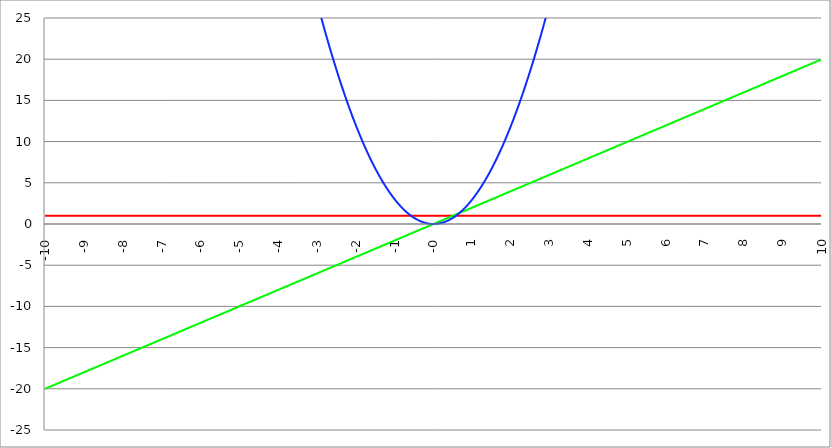
| Category | Series 1 | Series 0 | Series 2 |
|---|---|---|---|
| -10.0 | 1 | -20 | 300 |
| -9.99 | 1 | -19.98 | 299.4 |
| -9.98 | 1 | -19.96 | 298.801 |
| -9.97 | 1 | -19.94 | 298.203 |
| -9.96 | 1 | -19.92 | 297.605 |
| -9.95 | 1 | -19.9 | 297.008 |
| -9.940000000000001 | 1 | -19.88 | 296.411 |
| -9.930000000000001 | 1 | -19.86 | 295.815 |
| -9.920000000000002 | 1 | -19.84 | 295.219 |
| -9.91 | 1 | -19.82 | 294.624 |
| -9.900000000000002 | 1 | -19.8 | 294.03 |
| -9.890000000000002 | 1 | -19.78 | 293.436 |
| -9.880000000000003 | 1 | -19.76 | 292.843 |
| -9.870000000000003 | 1 | -19.74 | 292.251 |
| -9.860000000000001 | 1 | -19.72 | 291.659 |
| -9.850000000000003 | 1 | -19.7 | 291.068 |
| -9.840000000000003 | 1 | -19.68 | 290.477 |
| -9.830000000000004 | 1 | -19.66 | 289.887 |
| -9.820000000000004 | 1 | -19.64 | 289.297 |
| -9.810000000000004 | 1 | -19.62 | 288.708 |
| -9.800000000000004 | 1 | -19.6 | 288.12 |
| -9.790000000000004 | 1 | -19.58 | 287.532 |
| -9.780000000000005 | 1 | -19.56 | 286.945 |
| -9.770000000000005 | 1 | -19.54 | 286.359 |
| -9.760000000000005 | 1 | -19.52 | 285.773 |
| -9.750000000000005 | 1 | -19.5 | 285.188 |
| -9.740000000000006 | 1 | -19.48 | 284.603 |
| -9.730000000000006 | 1 | -19.46 | 284.019 |
| -9.720000000000006 | 1 | -19.44 | 283.435 |
| -9.710000000000006 | 1 | -19.42 | 282.852 |
| -9.700000000000006 | 1 | -19.4 | 282.27 |
| -9.690000000000007 | 1 | -19.38 | 281.688 |
| -9.680000000000007 | 1 | -19.36 | 281.107 |
| -9.670000000000007 | 1 | -19.34 | 280.527 |
| -9.660000000000007 | 1 | -19.32 | 279.947 |
| -9.650000000000007 | 1 | -19.3 | 279.368 |
| -9.640000000000008 | 1 | -19.28 | 278.789 |
| -9.630000000000008 | 1 | -19.26 | 278.211 |
| -9.620000000000008 | 1 | -19.24 | 277.633 |
| -9.610000000000008 | 1 | -19.22 | 277.056 |
| -9.600000000000009 | 1 | -19.2 | 276.48 |
| -9.590000000000009 | 1 | -19.18 | 275.904 |
| -9.580000000000007 | 1 | -19.16 | 275.329 |
| -9.57000000000001 | 1 | -19.14 | 274.755 |
| -9.56000000000001 | 1 | -19.12 | 274.181 |
| -9.55000000000001 | 1 | -19.1 | 273.608 |
| -9.54000000000001 | 1 | -19.08 | 273.035 |
| -9.53000000000001 | 1 | -19.06 | 272.463 |
| -9.52000000000001 | 1 | -19.04 | 271.891 |
| -9.51000000000001 | 1 | -19.02 | 271.32 |
| -9.50000000000001 | 1 | -19 | 270.75 |
| -9.49000000000001 | 1 | -18.98 | 270.18 |
| -9.48000000000001 | 1 | -18.96 | 269.611 |
| -9.47000000000001 | 1 | -18.94 | 269.043 |
| -9.46000000000001 | 1 | -18.92 | 268.475 |
| -9.45000000000001 | 1 | -18.9 | 267.908 |
| -9.44000000000001 | 1 | -18.88 | 267.341 |
| -9.430000000000012 | 1 | -18.86 | 266.775 |
| -9.420000000000012 | 1 | -18.84 | 266.209 |
| -9.410000000000013 | 1 | -18.82 | 265.644 |
| -9.400000000000013 | 1 | -18.8 | 265.08 |
| -9.390000000000011 | 1 | -18.78 | 264.516 |
| -9.380000000000013 | 1 | -18.76 | 263.953 |
| -9.370000000000013 | 1 | -18.74 | 263.391 |
| -9.360000000000014 | 1 | -18.72 | 262.829 |
| -9.350000000000014 | 1 | -18.7 | 262.268 |
| -9.340000000000014 | 1 | -18.68 | 261.707 |
| -9.330000000000014 | 1 | -18.66 | 261.147 |
| -9.320000000000014 | 1 | -18.64 | 260.587 |
| -9.310000000000015 | 1 | -18.62 | 260.028 |
| -9.300000000000013 | 1 | -18.6 | 259.47 |
| -9.290000000000015 | 1 | -18.58 | 258.912 |
| -9.280000000000015 | 1 | -18.56 | 258.355 |
| -9.270000000000016 | 1 | -18.54 | 257.799 |
| -9.260000000000016 | 1 | -18.52 | 257.243 |
| -9.250000000000014 | 1 | -18.5 | 256.688 |
| -9.240000000000016 | 1 | -18.48 | 256.133 |
| -9.230000000000016 | 1 | -18.46 | 255.579 |
| -9.220000000000017 | 1 | -18.44 | 255.025 |
| -9.210000000000017 | 1 | -18.42 | 254.472 |
| -9.200000000000017 | 1 | -18.4 | 253.92 |
| -9.190000000000017 | 1 | -18.38 | 253.368 |
| -9.180000000000017 | 1 | -18.36 | 252.817 |
| -9.170000000000018 | 1 | -18.34 | 252.267 |
| -9.160000000000016 | 1 | -18.32 | 251.717 |
| -9.150000000000018 | 1 | -18.3 | 251.168 |
| -9.140000000000018 | 1 | -18.28 | 250.619 |
| -9.130000000000019 | 1 | -18.26 | 250.071 |
| -9.120000000000019 | 1 | -18.24 | 249.523 |
| -9.110000000000017 | 1 | -18.22 | 248.976 |
| -9.10000000000002 | 1 | -18.2 | 248.43 |
| -9.09000000000002 | 1 | -18.18 | 247.884 |
| -9.08000000000002 | 1 | -18.16 | 247.339 |
| -9.07000000000002 | 1 | -18.14 | 246.795 |
| -9.06000000000002 | 1 | -18.12 | 246.251 |
| -9.05000000000002 | 1 | -18.1 | 245.708 |
| -9.04000000000002 | 1 | -18.08 | 245.165 |
| -9.03000000000002 | 1 | -18.06 | 244.623 |
| -9.020000000000021 | 1 | -18.04 | 244.081 |
| -9.010000000000021 | 1 | -18.02 | 243.54 |
| -9.000000000000021 | 1 | -18 | 243 |
| -8.990000000000022 | 1 | -17.98 | 242.46 |
| -8.980000000000022 | 1 | -17.96 | 241.921 |
| -8.97000000000002 | 1 | -17.94 | 241.383 |
| -8.960000000000022 | 1 | -17.92 | 240.845 |
| -8.950000000000022 | 1 | -17.9 | 240.308 |
| -8.940000000000023 | 1 | -17.88 | 239.771 |
| -8.930000000000023 | 1 | -17.86 | 239.235 |
| -8.920000000000023 | 1 | -17.84 | 238.699 |
| -8.910000000000023 | 1 | -17.82 | 238.164 |
| -8.900000000000023 | 1 | -17.8 | 237.63 |
| -8.890000000000024 | 1 | -17.78 | 237.096 |
| -8.880000000000024 | 1 | -17.76 | 236.563 |
| -8.870000000000024 | 1 | -17.74 | 236.031 |
| -8.860000000000024 | 1 | -17.72 | 235.499 |
| -8.850000000000025 | 1 | -17.7 | 234.968 |
| -8.840000000000025 | 1 | -17.68 | 234.437 |
| -8.830000000000025 | 1 | -17.66 | 233.907 |
| -8.820000000000025 | 1 | -17.64 | 233.377 |
| -8.810000000000025 | 1 | -17.62 | 232.848 |
| -8.800000000000026 | 1 | -17.6 | 232.32 |
| -8.790000000000026 | 1 | -17.58 | 231.792 |
| -8.780000000000026 | 1 | -17.56 | 231.265 |
| -8.770000000000026 | 1 | -17.54 | 230.739 |
| -8.760000000000026 | 1 | -17.52 | 230.213 |
| -8.750000000000027 | 1 | -17.5 | 229.688 |
| -8.740000000000027 | 1 | -17.48 | 229.163 |
| -8.730000000000027 | 1 | -17.46 | 228.639 |
| -8.720000000000027 | 1 | -17.44 | 228.115 |
| -8.710000000000027 | 1 | -17.42 | 227.592 |
| -8.700000000000028 | 1 | -17.4 | 227.07 |
| -8.690000000000028 | 1 | -17.38 | 226.548 |
| -8.680000000000028 | 1 | -17.36 | 226.027 |
| -8.670000000000028 | 1 | -17.34 | 225.507 |
| -8.660000000000029 | 1 | -17.32 | 224.987 |
| -8.650000000000029 | 1 | -17.3 | 224.468 |
| -8.640000000000029 | 1 | -17.28 | 223.949 |
| -8.63000000000003 | 1 | -17.26 | 223.431 |
| -8.62000000000003 | 1 | -17.24 | 222.913 |
| -8.61000000000003 | 1 | -17.22 | 222.396 |
| -8.60000000000003 | 1 | -17.2 | 221.88 |
| -8.59000000000003 | 1 | -17.18 | 221.364 |
| -8.58000000000003 | 1 | -17.16 | 220.849 |
| -8.57000000000003 | 1 | -17.14 | 220.335 |
| -8.56000000000003 | 1 | -17.12 | 219.821 |
| -8.55000000000003 | 1 | -17.1 | 219.308 |
| -8.540000000000031 | 1 | -17.08 | 218.795 |
| -8.530000000000031 | 1 | -17.06 | 218.283 |
| -8.520000000000032 | 1 | -17.04 | 217.771 |
| -8.510000000000032 | 1 | -17.02 | 217.26 |
| -8.50000000000003 | 1 | -17 | 216.75 |
| -8.490000000000032 | 1 | -16.98 | 216.24 |
| -8.480000000000032 | 1 | -16.96 | 215.731 |
| -8.470000000000033 | 1 | -16.94 | 215.223 |
| -8.460000000000033 | 1 | -16.92 | 214.715 |
| -8.450000000000033 | 1 | -16.9 | 214.208 |
| -8.440000000000033 | 1 | -16.88 | 213.701 |
| -8.430000000000033 | 1 | -16.86 | 213.195 |
| -8.420000000000034 | 1 | -16.84 | 212.689 |
| -8.410000000000032 | 1 | -16.82 | 212.184 |
| -8.400000000000034 | 1 | -16.8 | 211.68 |
| -8.390000000000034 | 1 | -16.78 | 211.176 |
| -8.380000000000035 | 1 | -16.76 | 210.673 |
| -8.370000000000035 | 1 | -16.74 | 210.171 |
| -8.360000000000033 | 1 | -16.72 | 209.669 |
| -8.350000000000035 | 1 | -16.7 | 209.168 |
| -8.340000000000035 | 1 | -16.68 | 208.667 |
| -8.330000000000036 | 1 | -16.66 | 208.167 |
| -8.320000000000036 | 1 | -16.64 | 207.667 |
| -8.310000000000034 | 1 | -16.62 | 207.168 |
| -8.300000000000036 | 1 | -16.6 | 206.67 |
| -8.290000000000036 | 1 | -16.58 | 206.172 |
| -8.280000000000037 | 1 | -16.56 | 205.675 |
| -8.270000000000037 | 1 | -16.54 | 205.179 |
| -8.260000000000037 | 1 | -16.52 | 204.683 |
| -8.250000000000037 | 1 | -16.5 | 204.188 |
| -8.240000000000038 | 1 | -16.48 | 203.693 |
| -8.230000000000038 | 1 | -16.46 | 203.199 |
| -8.220000000000038 | 1 | -16.44 | 202.705 |
| -8.210000000000038 | 1 | -16.42 | 202.212 |
| -8.200000000000038 | 1 | -16.4 | 201.72 |
| -8.190000000000039 | 1 | -16.38 | 201.228 |
| -8.180000000000039 | 1 | -16.36 | 200.737 |
| -8.170000000000037 | 1 | -16.34 | 200.247 |
| -8.16000000000004 | 1 | -16.32 | 199.757 |
| -8.15000000000004 | 1 | -16.3 | 199.268 |
| -8.14000000000004 | 1 | -16.28 | 198.779 |
| -8.13000000000004 | 1 | -16.26 | 198.291 |
| -8.12000000000004 | 1 | -16.24 | 197.803 |
| -8.11000000000004 | 1 | -16.22 | 197.316 |
| -8.10000000000004 | 1 | -16.2 | 196.83 |
| -8.09000000000004 | 1 | -16.18 | 196.344 |
| -8.08000000000004 | 1 | -16.16 | 195.859 |
| -8.07000000000004 | 1 | -16.14 | 195.375 |
| -8.06000000000004 | 1 | -16.12 | 194.891 |
| -8.05000000000004 | 1 | -16.1 | 194.408 |
| -8.040000000000042 | 1 | -16.08 | 193.925 |
| -8.03000000000004 | 1 | -16.06 | 193.443 |
| -8.020000000000042 | 1 | -16.04 | 192.961 |
| -8.010000000000042 | 1 | -16.02 | 192.48 |
| -8.000000000000043 | 1 | -16 | 192 |
| -7.990000000000043 | 1 | -15.98 | 191.52 |
| -7.980000000000043 | 1 | -15.96 | 191.041 |
| -7.970000000000043 | 1 | -15.94 | 190.563 |
| -7.960000000000043 | 1 | -15.92 | 190.085 |
| -7.950000000000044 | 1 | -15.9 | 189.608 |
| -7.940000000000044 | 1 | -15.88 | 189.131 |
| -7.930000000000044 | 1 | -15.86 | 188.655 |
| -7.920000000000044 | 1 | -15.84 | 188.179 |
| -7.910000000000044 | 1 | -15.82 | 187.704 |
| -7.900000000000044 | 1 | -15.8 | 187.23 |
| -7.890000000000045 | 1 | -15.78 | 186.756 |
| -7.880000000000045 | 1 | -15.76 | 186.283 |
| -7.870000000000045 | 1 | -15.74 | 185.811 |
| -7.860000000000046 | 1 | -15.72 | 185.339 |
| -7.850000000000046 | 1 | -15.7 | 184.868 |
| -7.840000000000046 | 1 | -15.68 | 184.397 |
| -7.830000000000046 | 1 | -15.66 | 183.927 |
| -7.820000000000046 | 1 | -15.64 | 183.457 |
| -7.810000000000047 | 1 | -15.62 | 182.988 |
| -7.800000000000047 | 1 | -15.6 | 182.52 |
| -7.790000000000047 | 1 | -15.58 | 182.052 |
| -7.780000000000047 | 1 | -15.56 | 181.585 |
| -7.770000000000047 | 1 | -15.54 | 181.119 |
| -7.760000000000048 | 1 | -15.52 | 180.653 |
| -7.750000000000048 | 1 | -15.5 | 180.188 |
| -7.740000000000048 | 1 | -15.48 | 179.723 |
| -7.730000000000048 | 1 | -15.46 | 179.259 |
| -7.720000000000049 | 1 | -15.44 | 178.795 |
| -7.710000000000049 | 1 | -15.42 | 178.332 |
| -7.700000000000049 | 1 | -15.4 | 177.87 |
| -7.690000000000049 | 1 | -15.38 | 177.408 |
| -7.680000000000049 | 1 | -15.36 | 176.947 |
| -7.67000000000005 | 1 | -15.34 | 176.487 |
| -7.66000000000005 | 1 | -15.32 | 176.027 |
| -7.65000000000005 | 1 | -15.3 | 175.568 |
| -7.64000000000005 | 1 | -15.28 | 175.109 |
| -7.63000000000005 | 1 | -15.26 | 174.651 |
| -7.620000000000051 | 1 | -15.24 | 174.193 |
| -7.610000000000051 | 1 | -15.22 | 173.736 |
| -7.600000000000051 | 1 | -15.2 | 173.28 |
| -7.590000000000051 | 1 | -15.18 | 172.824 |
| -7.580000000000052 | 1 | -15.16 | 172.369 |
| -7.570000000000052 | 1 | -15.14 | 171.915 |
| -7.560000000000052 | 1 | -15.12 | 171.461 |
| -7.550000000000052 | 1 | -15.1 | 171.008 |
| -7.540000000000052 | 1 | -15.08 | 170.555 |
| -7.530000000000053 | 1 | -15.06 | 170.103 |
| -7.520000000000053 | 1 | -15.04 | 169.651 |
| -7.510000000000053 | 1 | -15.02 | 169.2 |
| -7.500000000000053 | 1 | -15 | 168.75 |
| -7.490000000000053 | 1 | -14.98 | 168.3 |
| -7.480000000000054 | 1 | -14.96 | 167.851 |
| -7.470000000000054 | 1 | -14.94 | 167.403 |
| -7.460000000000054 | 1 | -14.92 | 166.955 |
| -7.450000000000054 | 1 | -14.9 | 166.508 |
| -7.440000000000054 | 1 | -14.88 | 166.061 |
| -7.430000000000054 | 1 | -14.86 | 165.615 |
| -7.420000000000055 | 1 | -14.84 | 165.169 |
| -7.410000000000055 | 1 | -14.82 | 164.724 |
| -7.400000000000055 | 1 | -14.8 | 164.28 |
| -7.390000000000056 | 1 | -14.78 | 163.836 |
| -7.380000000000056 | 1 | -14.76 | 163.393 |
| -7.370000000000056 | 1 | -14.74 | 162.951 |
| -7.360000000000056 | 1 | -14.72 | 162.509 |
| -7.350000000000056 | 1 | -14.7 | 162.068 |
| -7.340000000000057 | 1 | -14.68 | 161.627 |
| -7.330000000000057 | 1 | -14.66 | 161.187 |
| -7.320000000000057 | 1 | -14.64 | 160.747 |
| -7.310000000000057 | 1 | -14.62 | 160.308 |
| -7.300000000000058 | 1 | -14.6 | 159.87 |
| -7.290000000000058 | 1 | -14.58 | 159.432 |
| -7.280000000000058 | 1 | -14.56 | 158.995 |
| -7.270000000000058 | 1 | -14.54 | 158.559 |
| -7.260000000000058 | 1 | -14.52 | 158.123 |
| -7.250000000000059 | 1 | -14.5 | 157.688 |
| -7.240000000000059 | 1 | -14.48 | 157.253 |
| -7.23000000000006 | 1 | -14.46 | 156.819 |
| -7.220000000000059 | 1 | -14.44 | 156.385 |
| -7.210000000000059 | 1 | -14.42 | 155.952 |
| -7.20000000000006 | 1 | -14.4 | 155.52 |
| -7.19000000000006 | 1 | -14.38 | 155.088 |
| -7.18000000000006 | 1 | -14.36 | 154.657 |
| -7.17000000000006 | 1 | -14.34 | 154.227 |
| -7.160000000000061 | 1 | -14.32 | 153.797 |
| -7.150000000000061 | 1 | -14.3 | 153.368 |
| -7.140000000000061 | 1 | -14.28 | 152.939 |
| -7.130000000000061 | 1 | -14.26 | 152.511 |
| -7.120000000000061 | 1 | -14.24 | 152.083 |
| -7.110000000000062 | 1 | -14.22 | 151.656 |
| -7.100000000000062 | 1 | -14.2 | 151.23 |
| -7.090000000000062 | 1 | -14.18 | 150.804 |
| -7.080000000000062 | 1 | -14.16 | 150.379 |
| -7.070000000000062 | 1 | -14.14 | 149.955 |
| -7.060000000000063 | 1 | -14.12 | 149.531 |
| -7.050000000000063 | 1 | -14.1 | 149.108 |
| -7.040000000000063 | 1 | -14.08 | 148.685 |
| -7.030000000000063 | 1 | -14.06 | 148.263 |
| -7.020000000000064 | 1 | -14.04 | 147.841 |
| -7.010000000000064 | 1 | -14.02 | 147.42 |
| -7.000000000000064 | 1 | -14 | 147 |
| -6.990000000000064 | 1 | -13.98 | 146.58 |
| -6.980000000000064 | 1 | -13.96 | 146.161 |
| -6.970000000000064 | 1 | -13.94 | 145.743 |
| -6.960000000000064 | 1 | -13.92 | 145.325 |
| -6.950000000000064 | 1 | -13.9 | 144.908 |
| -6.940000000000065 | 1 | -13.88 | 144.491 |
| -6.930000000000065 | 1 | -13.86 | 144.075 |
| -6.920000000000065 | 1 | -13.84 | 143.659 |
| -6.910000000000065 | 1 | -13.82 | 143.244 |
| -6.900000000000066 | 1 | -13.8 | 142.83 |
| -6.890000000000066 | 1 | -13.78 | 142.416 |
| -6.880000000000066 | 1 | -13.76 | 142.003 |
| -6.870000000000066 | 1 | -13.74 | 141.591 |
| -6.860000000000067 | 1 | -13.72 | 141.179 |
| -6.850000000000067 | 1 | -13.7 | 140.768 |
| -6.840000000000067 | 1 | -13.68 | 140.357 |
| -6.830000000000067 | 1 | -13.66 | 139.947 |
| -6.820000000000068 | 1 | -13.64 | 139.537 |
| -6.810000000000068 | 1 | -13.62 | 139.128 |
| -6.800000000000068 | 1 | -13.6 | 138.72 |
| -6.790000000000068 | 1 | -13.58 | 138.312 |
| -6.780000000000068 | 1 | -13.56 | 137.905 |
| -6.770000000000068 | 1 | -13.54 | 137.499 |
| -6.760000000000069 | 1 | -13.52 | 137.093 |
| -6.75000000000007 | 1 | -13.5 | 136.688 |
| -6.74000000000007 | 1 | -13.48 | 136.283 |
| -6.73000000000007 | 1 | -13.46 | 135.879 |
| -6.72000000000007 | 1 | -13.44 | 135.475 |
| -6.71000000000007 | 1 | -13.42 | 135.072 |
| -6.70000000000007 | 1 | -13.4 | 134.67 |
| -6.69000000000007 | 1 | -13.38 | 134.268 |
| -6.680000000000071 | 1 | -13.36 | 133.867 |
| -6.670000000000071 | 1 | -13.34 | 133.467 |
| -6.660000000000071 | 1 | -13.32 | 133.067 |
| -6.650000000000071 | 1 | -13.3 | 132.668 |
| -6.640000000000072 | 1 | -13.28 | 132.269 |
| -6.630000000000072 | 1 | -13.26 | 131.871 |
| -6.620000000000072 | 1 | -13.24 | 131.473 |
| -6.610000000000072 | 1 | -13.22 | 131.076 |
| -6.600000000000072 | 1 | -13.2 | 130.68 |
| -6.590000000000073 | 1 | -13.18 | 130.284 |
| -6.580000000000073 | 1 | -13.16 | 129.889 |
| -6.570000000000073 | 1 | -13.14 | 129.495 |
| -6.560000000000073 | 1 | -13.12 | 129.101 |
| -6.550000000000074 | 1 | -13.1 | 128.708 |
| -6.540000000000074 | 1 | -13.08 | 128.315 |
| -6.530000000000074 | 1 | -13.06 | 127.923 |
| -6.520000000000074 | 1 | -13.04 | 127.531 |
| -6.510000000000074 | 1 | -13.02 | 127.14 |
| -6.500000000000074 | 1 | -13 | 126.75 |
| -6.490000000000074 | 1 | -12.98 | 126.36 |
| -6.480000000000074 | 1 | -12.96 | 125.971 |
| -6.470000000000075 | 1 | -12.94 | 125.583 |
| -6.460000000000075 | 1 | -12.92 | 125.195 |
| -6.450000000000075 | 1 | -12.9 | 124.808 |
| -6.440000000000075 | 1 | -12.88 | 124.421 |
| -6.430000000000076 | 1 | -12.86 | 124.035 |
| -6.420000000000076 | 1 | -12.84 | 123.649 |
| -6.410000000000076 | 1 | -12.82 | 123.264 |
| -6.400000000000076 | 1 | -12.8 | 122.88 |
| -6.390000000000077 | 1 | -12.78 | 122.496 |
| -6.380000000000077 | 1 | -12.76 | 122.113 |
| -6.370000000000077 | 1 | -12.74 | 121.731 |
| -6.360000000000078 | 1 | -12.72 | 121.349 |
| -6.350000000000078 | 1 | -12.7 | 120.968 |
| -6.340000000000078 | 1 | -12.68 | 120.587 |
| -6.330000000000078 | 1 | -12.66 | 120.207 |
| -6.320000000000078 | 1 | -12.64 | 119.827 |
| -6.310000000000079 | 1 | -12.62 | 119.448 |
| -6.300000000000079 | 1 | -12.6 | 119.07 |
| -6.29000000000008 | 1 | -12.58 | 118.692 |
| -6.28000000000008 | 1 | -12.56 | 118.315 |
| -6.27000000000008 | 1 | -12.54 | 117.939 |
| -6.26000000000008 | 1 | -12.52 | 117.563 |
| -6.25000000000008 | 1 | -12.5 | 117.188 |
| -6.24000000000008 | 1 | -12.48 | 116.813 |
| -6.23000000000008 | 1 | -12.46 | 116.439 |
| -6.220000000000081 | 1 | -12.44 | 116.065 |
| -6.210000000000081 | 1 | -12.42 | 115.692 |
| -6.200000000000081 | 1 | -12.4 | 115.32 |
| -6.190000000000081 | 1 | -12.38 | 114.948 |
| -6.180000000000081 | 1 | -12.36 | 114.577 |
| -6.170000000000082 | 1 | -12.34 | 114.207 |
| -6.160000000000082 | 1 | -12.32 | 113.837 |
| -6.150000000000082 | 1 | -12.3 | 113.468 |
| -6.140000000000082 | 1 | -12.28 | 113.099 |
| -6.130000000000082 | 1 | -12.26 | 112.731 |
| -6.120000000000083 | 1 | -12.24 | 112.363 |
| -6.110000000000083 | 1 | -12.22 | 111.996 |
| -6.100000000000083 | 1 | -12.2 | 111.63 |
| -6.090000000000083 | 1 | -12.18 | 111.264 |
| -6.080000000000084 | 1 | -12.16 | 110.899 |
| -6.070000000000084 | 1 | -12.14 | 110.535 |
| -6.060000000000084 | 1 | -12.12 | 110.171 |
| -6.050000000000084 | 1 | -12.1 | 109.808 |
| -6.040000000000084 | 1 | -12.08 | 109.445 |
| -6.030000000000084 | 1 | -12.06 | 109.083 |
| -6.020000000000085 | 1 | -12.04 | 108.721 |
| -6.010000000000085 | 1 | -12.02 | 108.36 |
| -6.000000000000085 | 1 | -12 | 108 |
| -5.990000000000085 | 1 | -11.98 | 107.64 |
| -5.980000000000085 | 1 | -11.96 | 107.281 |
| -5.970000000000085 | 1 | -11.94 | 106.923 |
| -5.960000000000086 | 1 | -11.92 | 106.565 |
| -5.950000000000086 | 1 | -11.9 | 106.208 |
| -5.940000000000086 | 1 | -11.88 | 105.851 |
| -5.930000000000086 | 1 | -11.86 | 105.495 |
| -5.920000000000087 | 1 | -11.84 | 105.139 |
| -5.910000000000087 | 1 | -11.82 | 104.784 |
| -5.900000000000087 | 1 | -11.8 | 104.43 |
| -5.890000000000088 | 1 | -11.78 | 104.076 |
| -5.880000000000088 | 1 | -11.76 | 103.723 |
| -5.870000000000088 | 1 | -11.74 | 103.371 |
| -5.860000000000088 | 1 | -11.72 | 103.019 |
| -5.850000000000088 | 1 | -11.7 | 102.668 |
| -5.840000000000089 | 1 | -11.68 | 102.317 |
| -5.830000000000089 | 1 | -11.66 | 101.967 |
| -5.820000000000089 | 1 | -11.64 | 101.617 |
| -5.810000000000089 | 1 | -11.62 | 101.268 |
| -5.800000000000089 | 1 | -11.6 | 100.92 |
| -5.79000000000009 | 1 | -11.58 | 100.572 |
| -5.78000000000009 | 1 | -11.56 | 100.225 |
| -5.77000000000009 | 1 | -11.54 | 99.879 |
| -5.76000000000009 | 1 | -11.52 | 99.533 |
| -5.750000000000091 | 1 | -11.5 | 99.188 |
| -5.740000000000091 | 1 | -11.48 | 98.843 |
| -5.730000000000091 | 1 | -11.46 | 98.499 |
| -5.720000000000091 | 1 | -11.44 | 98.155 |
| -5.710000000000091 | 1 | -11.42 | 97.812 |
| -5.700000000000092 | 1 | -11.4 | 97.47 |
| -5.690000000000092 | 1 | -11.38 | 97.128 |
| -5.680000000000092 | 1 | -11.36 | 96.787 |
| -5.670000000000092 | 1 | -11.34 | 96.447 |
| -5.660000000000092 | 1 | -11.32 | 96.107 |
| -5.650000000000093 | 1 | -11.3 | 95.768 |
| -5.640000000000093 | 1 | -11.28 | 95.429 |
| -5.630000000000093 | 1 | -11.26 | 95.091 |
| -5.620000000000093 | 1 | -11.24 | 94.753 |
| -5.610000000000093 | 1 | -11.22 | 94.416 |
| -5.600000000000094 | 1 | -11.2 | 94.08 |
| -5.590000000000094 | 1 | -11.18 | 93.744 |
| -5.580000000000094 | 1 | -11.16 | 93.409 |
| -5.570000000000094 | 1 | -11.14 | 93.075 |
| -5.560000000000095 | 1 | -11.12 | 92.741 |
| -5.550000000000095 | 1 | -11.1 | 92.408 |
| -5.540000000000095 | 1 | -11.08 | 92.075 |
| -5.530000000000095 | 1 | -11.06 | 91.743 |
| -5.520000000000095 | 1 | -11.04 | 91.411 |
| -5.510000000000096 | 1 | -11.02 | 91.08 |
| -5.500000000000096 | 1 | -11 | 90.75 |
| -5.490000000000096 | 1 | -10.98 | 90.42 |
| -5.480000000000096 | 1 | -10.96 | 90.091 |
| -5.470000000000096 | 1 | -10.94 | 89.763 |
| -5.460000000000097 | 1 | -10.92 | 89.435 |
| -5.450000000000097 | 1 | -10.9 | 89.108 |
| -5.440000000000097 | 1 | -10.88 | 88.781 |
| -5.430000000000097 | 1 | -10.86 | 88.455 |
| -5.420000000000098 | 1 | -10.84 | 88.129 |
| -5.410000000000098 | 1 | -10.82 | 87.804 |
| -5.400000000000098 | 1 | -10.8 | 87.48 |
| -5.390000000000098 | 1 | -10.78 | 87.156 |
| -5.380000000000098 | 1 | -10.76 | 86.833 |
| -5.370000000000099 | 1 | -10.74 | 86.511 |
| -5.360000000000099 | 1 | -10.72 | 86.189 |
| -5.350000000000099 | 1 | -10.7 | 85.868 |
| -5.340000000000099 | 1 | -10.68 | 85.547 |
| -5.330000000000099 | 1 | -10.66 | 85.227 |
| -5.3200000000001 | 1 | -10.64 | 84.907 |
| -5.3100000000001 | 1 | -10.62 | 84.588 |
| -5.3000000000001 | 1 | -10.6 | 84.27 |
| -5.2900000000001 | 1 | -10.58 | 83.952 |
| -5.2800000000001 | 1 | -10.56 | 83.635 |
| -5.2700000000001 | 1 | -10.54 | 83.319 |
| -5.260000000000101 | 1 | -10.52 | 83.003 |
| -5.250000000000101 | 1 | -10.5 | 82.688 |
| -5.240000000000101 | 1 | -10.48 | 82.373 |
| -5.230000000000101 | 1 | -10.46 | 82.059 |
| -5.220000000000102 | 1 | -10.44 | 81.745 |
| -5.210000000000102 | 1 | -10.42 | 81.432 |
| -5.200000000000102 | 1 | -10.4 | 81.12 |
| -5.190000000000103 | 1 | -10.38 | 80.808 |
| -5.180000000000103 | 1 | -10.36 | 80.497 |
| -5.170000000000103 | 1 | -10.34 | 80.187 |
| -5.160000000000103 | 1 | -10.32 | 79.877 |
| -5.150000000000103 | 1 | -10.3 | 79.568 |
| -5.140000000000104 | 1 | -10.28 | 79.259 |
| -5.130000000000104 | 1 | -10.26 | 78.951 |
| -5.120000000000104 | 1 | -10.24 | 78.643 |
| -5.110000000000104 | 1 | -10.22 | 78.336 |
| -5.100000000000104 | 1 | -10.2 | 78.03 |
| -5.090000000000104 | 1 | -10.18 | 77.724 |
| -5.080000000000104 | 1 | -10.16 | 77.419 |
| -5.070000000000105 | 1 | -10.14 | 77.115 |
| -5.060000000000105 | 1 | -10.12 | 76.811 |
| -5.050000000000105 | 1 | -10.1 | 76.508 |
| -5.040000000000105 | 1 | -10.08 | 76.205 |
| -5.030000000000105 | 1 | -10.06 | 75.903 |
| -5.020000000000106 | 1 | -10.04 | 75.601 |
| -5.010000000000106 | 1 | -10.02 | 75.3 |
| -5.000000000000106 | 1 | -10 | 75 |
| -4.990000000000106 | 1 | -9.98 | 74.7 |
| -4.980000000000106 | 1 | -9.96 | 74.401 |
| -4.970000000000107 | 1 | -9.94 | 74.103 |
| -4.960000000000107 | 1 | -9.92 | 73.805 |
| -4.950000000000107 | 1 | -9.9 | 73.508 |
| -4.940000000000107 | 1 | -9.88 | 73.211 |
| -4.930000000000108 | 1 | -9.86 | 72.915 |
| -4.920000000000108 | 1 | -9.84 | 72.619 |
| -4.910000000000108 | 1 | -9.82 | 72.324 |
| -4.900000000000108 | 1 | -9.8 | 72.03 |
| -4.890000000000109 | 1 | -9.78 | 71.736 |
| -4.88000000000011 | 1 | -9.76 | 71.443 |
| -4.87000000000011 | 1 | -9.74 | 71.151 |
| -4.86000000000011 | 1 | -9.72 | 70.859 |
| -4.85000000000011 | 1 | -9.7 | 70.568 |
| -4.84000000000011 | 1 | -9.68 | 70.277 |
| -4.83000000000011 | 1 | -9.66 | 69.987 |
| -4.82000000000011 | 1 | -9.64 | 69.697 |
| -4.810000000000111 | 1 | -9.62 | 69.408 |
| -4.800000000000111 | 1 | -9.6 | 69.12 |
| -4.790000000000111 | 1 | -9.58 | 68.832 |
| -4.780000000000111 | 1 | -9.56 | 68.545 |
| -4.770000000000111 | 1 | -9.54 | 68.259 |
| -4.760000000000112 | 1 | -9.52 | 67.973 |
| -4.750000000000112 | 1 | -9.5 | 67.688 |
| -4.740000000000112 | 1 | -9.48 | 67.403 |
| -4.730000000000112 | 1 | -9.46 | 67.119 |
| -4.720000000000112 | 1 | -9.44 | 66.835 |
| -4.710000000000113 | 1 | -9.42 | 66.552 |
| -4.700000000000113 | 1 | -9.4 | 66.27 |
| -4.690000000000113 | 1 | -9.38 | 65.988 |
| -4.680000000000113 | 1 | -9.36 | 65.707 |
| -4.670000000000114 | 1 | -9.34 | 65.427 |
| -4.660000000000114 | 1 | -9.32 | 65.147 |
| -4.650000000000114 | 1 | -9.3 | 64.868 |
| -4.640000000000114 | 1 | -9.28 | 64.589 |
| -4.630000000000114 | 1 | -9.26 | 64.311 |
| -4.620000000000115 | 1 | -9.24 | 64.033 |
| -4.610000000000115 | 1 | -9.22 | 63.756 |
| -4.600000000000115 | 1 | -9.2 | 63.48 |
| -4.590000000000115 | 1 | -9.18 | 63.204 |
| -4.580000000000115 | 1 | -9.16 | 62.929 |
| -4.570000000000115 | 1 | -9.14 | 62.655 |
| -4.560000000000116 | 1 | -9.12 | 62.381 |
| -4.550000000000116 | 1 | -9.1 | 62.108 |
| -4.540000000000116 | 1 | -9.08 | 61.835 |
| -4.530000000000116 | 1 | -9.06 | 61.563 |
| -4.520000000000117 | 1 | -9.04 | 61.291 |
| -4.510000000000117 | 1 | -9.02 | 61.02 |
| -4.500000000000117 | 1 | -9 | 60.75 |
| -4.490000000000117 | 1 | -8.98 | 60.48 |
| -4.480000000000117 | 1 | -8.96 | 60.211 |
| -4.470000000000117 | 1 | -8.94 | 59.943 |
| -4.460000000000118 | 1 | -8.92 | 59.675 |
| -4.450000000000118 | 1 | -8.9 | 59.408 |
| -4.440000000000118 | 1 | -8.88 | 59.141 |
| -4.430000000000118 | 1 | -8.86 | 58.875 |
| -4.420000000000119 | 1 | -8.84 | 58.609 |
| -4.41000000000012 | 1 | -8.82 | 58.344 |
| -4.40000000000012 | 1 | -8.8 | 58.08 |
| -4.39000000000012 | 1 | -8.78 | 57.816 |
| -4.38000000000012 | 1 | -8.76 | 57.553 |
| -4.37000000000012 | 1 | -8.74 | 57.291 |
| -4.36000000000012 | 1 | -8.72 | 57.029 |
| -4.35000000000012 | 1 | -8.7 | 56.768 |
| -4.34000000000012 | 1 | -8.68 | 56.507 |
| -4.33000000000012 | 1 | -8.66 | 56.247 |
| -4.320000000000121 | 1 | -8.64 | 55.987 |
| -4.310000000000121 | 1 | -8.62 | 55.728 |
| -4.300000000000121 | 1 | -8.6 | 55.47 |
| -4.290000000000121 | 1 | -8.58 | 55.212 |
| -4.280000000000121 | 1 | -8.56 | 54.955 |
| -4.270000000000122 | 1 | -8.54 | 54.699 |
| -4.260000000000122 | 1 | -8.52 | 54.443 |
| -4.250000000000122 | 1 | -8.5 | 54.188 |
| -4.240000000000122 | 1 | -8.48 | 53.933 |
| -4.230000000000122 | 1 | -8.46 | 53.679 |
| -4.220000000000123 | 1 | -8.44 | 53.425 |
| -4.210000000000123 | 1 | -8.42 | 53.172 |
| -4.200000000000123 | 1 | -8.4 | 52.92 |
| -4.190000000000124 | 1 | -8.38 | 52.668 |
| -4.180000000000124 | 1 | -8.36 | 52.417 |
| -4.170000000000124 | 1 | -8.34 | 52.167 |
| -4.160000000000124 | 1 | -8.32 | 51.917 |
| -4.150000000000124 | 1 | -8.3 | 51.668 |
| -4.140000000000124 | 1 | -8.28 | 51.419 |
| -4.130000000000125 | 1 | -8.26 | 51.171 |
| -4.120000000000125 | 1 | -8.24 | 50.923 |
| -4.110000000000125 | 1 | -8.22 | 50.676 |
| -4.100000000000125 | 1 | -8.2 | 50.43 |
| -4.090000000000125 | 1 | -8.18 | 50.184 |
| -4.080000000000126 | 1 | -8.16 | 49.939 |
| -4.070000000000126 | 1 | -8.14 | 49.695 |
| -4.060000000000126 | 1 | -8.12 | 49.451 |
| -4.050000000000126 | 1 | -8.1 | 49.208 |
| -4.040000000000127 | 1 | -8.08 | 48.965 |
| -4.030000000000127 | 1 | -8.06 | 48.723 |
| -4.020000000000127 | 1 | -8.04 | 48.481 |
| -4.010000000000127 | 1 | -8.02 | 48.24 |
| -4.000000000000127 | 1 | -8 | 48 |
| -3.990000000000128 | 1 | -7.98 | 47.76 |
| -3.980000000000128 | 1 | -7.96 | 47.521 |
| -3.970000000000129 | 1 | -7.94 | 47.283 |
| -3.960000000000129 | 1 | -7.92 | 47.045 |
| -3.950000000000129 | 1 | -7.9 | 46.808 |
| -3.940000000000129 | 1 | -7.88 | 46.571 |
| -3.930000000000129 | 1 | -7.86 | 46.335 |
| -3.92000000000013 | 1 | -7.84 | 46.099 |
| -3.91000000000013 | 1 | -7.82 | 45.864 |
| -3.90000000000013 | 1 | -7.8 | 45.63 |
| -3.89000000000013 | 1 | -7.78 | 45.396 |
| -3.88000000000013 | 1 | -7.76 | 45.163 |
| -3.870000000000131 | 1 | -7.74 | 44.931 |
| -3.860000000000131 | 1 | -7.72 | 44.699 |
| -3.850000000000131 | 1 | -7.7 | 44.468 |
| -3.840000000000131 | 1 | -7.68 | 44.237 |
| -3.830000000000131 | 1 | -7.66 | 44.007 |
| -3.820000000000132 | 1 | -7.64 | 43.777 |
| -3.810000000000132 | 1 | -7.62 | 43.548 |
| -3.800000000000132 | 1 | -7.6 | 43.32 |
| -3.790000000000132 | 1 | -7.58 | 43.092 |
| -3.780000000000132 | 1 | -7.56 | 42.865 |
| -3.770000000000133 | 1 | -7.54 | 42.639 |
| -3.760000000000133 | 1 | -7.52 | 42.413 |
| -3.750000000000133 | 1 | -7.5 | 42.188 |
| -3.740000000000133 | 1 | -7.48 | 41.963 |
| -3.730000000000134 | 1 | -7.46 | 41.739 |
| -3.720000000000134 | 1 | -7.44 | 41.515 |
| -3.710000000000134 | 1 | -7.42 | 41.292 |
| -3.700000000000134 | 1 | -7.4 | 41.07 |
| -3.690000000000134 | 1 | -7.38 | 40.848 |
| -3.680000000000135 | 1 | -7.36 | 40.627 |
| -3.670000000000135 | 1 | -7.34 | 40.407 |
| -3.660000000000135 | 1 | -7.32 | 40.187 |
| -3.650000000000135 | 1 | -7.3 | 39.968 |
| -3.640000000000135 | 1 | -7.28 | 39.749 |
| -3.630000000000136 | 1 | -7.26 | 39.531 |
| -3.620000000000136 | 1 | -7.24 | 39.313 |
| -3.610000000000136 | 1 | -7.22 | 39.096 |
| -3.600000000000136 | 1 | -7.2 | 38.88 |
| -3.590000000000137 | 1 | -7.18 | 38.664 |
| -3.580000000000137 | 1 | -7.16 | 38.449 |
| -3.570000000000137 | 1 | -7.14 | 38.235 |
| -3.560000000000137 | 1 | -7.12 | 38.021 |
| -3.550000000000137 | 1 | -7.1 | 37.808 |
| -3.540000000000138 | 1 | -7.08 | 37.595 |
| -3.530000000000138 | 1 | -7.06 | 37.383 |
| -3.520000000000138 | 1 | -7.04 | 37.171 |
| -3.510000000000138 | 1 | -7.02 | 36.96 |
| -3.500000000000139 | 1 | -7 | 36.75 |
| -3.490000000000139 | 1 | -6.98 | 36.54 |
| -3.480000000000139 | 1 | -6.96 | 36.331 |
| -3.470000000000139 | 1 | -6.94 | 36.123 |
| -3.460000000000139 | 1 | -6.92 | 35.915 |
| -3.45000000000014 | 1 | -6.9 | 35.708 |
| -3.44000000000014 | 1 | -6.88 | 35.501 |
| -3.43000000000014 | 1 | -6.86 | 35.295 |
| -3.42000000000014 | 1 | -6.84 | 35.089 |
| -3.41000000000014 | 1 | -6.82 | 34.884 |
| -3.400000000000141 | 1 | -6.8 | 34.68 |
| -3.390000000000141 | 1 | -6.78 | 34.476 |
| -3.380000000000141 | 1 | -6.76 | 34.273 |
| -3.370000000000141 | 1 | -6.74 | 34.071 |
| -3.360000000000141 | 1 | -6.72 | 33.869 |
| -3.350000000000142 | 1 | -6.7 | 33.668 |
| -3.340000000000142 | 1 | -6.68 | 33.467 |
| -3.330000000000142 | 1 | -6.66 | 33.267 |
| -3.320000000000142 | 1 | -6.64 | 33.067 |
| -3.310000000000143 | 1 | -6.62 | 32.868 |
| -3.300000000000143 | 1 | -6.6 | 32.67 |
| -3.290000000000143 | 1 | -6.58 | 32.472 |
| -3.280000000000143 | 1 | -6.56 | 32.275 |
| -3.270000000000143 | 1 | -6.54 | 32.079 |
| -3.260000000000144 | 1 | -6.52 | 31.883 |
| -3.250000000000144 | 1 | -6.5 | 31.688 |
| -3.240000000000144 | 1 | -6.48 | 31.493 |
| -3.230000000000144 | 1 | -6.46 | 31.299 |
| -3.220000000000145 | 1 | -6.44 | 31.105 |
| -3.210000000000145 | 1 | -6.42 | 30.912 |
| -3.200000000000145 | 1 | -6.4 | 30.72 |
| -3.190000000000145 | 1 | -6.38 | 30.528 |
| -3.180000000000145 | 1 | -6.36 | 30.337 |
| -3.170000000000146 | 1 | -6.34 | 30.147 |
| -3.160000000000146 | 1 | -6.32 | 29.957 |
| -3.150000000000146 | 1 | -6.3 | 29.768 |
| -3.140000000000146 | 1 | -6.28 | 29.579 |
| -3.130000000000146 | 1 | -6.26 | 29.391 |
| -3.120000000000147 | 1 | -6.24 | 29.203 |
| -3.110000000000147 | 1 | -6.22 | 29.016 |
| -3.100000000000147 | 1 | -6.2 | 28.83 |
| -3.090000000000147 | 1 | -6.18 | 28.644 |
| -3.080000000000147 | 1 | -6.16 | 28.459 |
| -3.070000000000148 | 1 | -6.14 | 28.275 |
| -3.060000000000148 | 1 | -6.12 | 28.091 |
| -3.050000000000148 | 1 | -6.1 | 27.908 |
| -3.040000000000148 | 1 | -6.08 | 27.725 |
| -3.030000000000149 | 1 | -6.06 | 27.543 |
| -3.020000000000149 | 1 | -6.04 | 27.361 |
| -3.010000000000149 | 1 | -6.02 | 27.18 |
| -3.000000000000149 | 1 | -6 | 27 |
| -2.990000000000149 | 1 | -5.98 | 26.82 |
| -2.98000000000015 | 1 | -5.96 | 26.641 |
| -2.97000000000015 | 1 | -5.94 | 26.463 |
| -2.96000000000015 | 1 | -5.92 | 26.285 |
| -2.95000000000015 | 1 | -5.9 | 26.108 |
| -2.94000000000015 | 1 | -5.88 | 25.931 |
| -2.930000000000151 | 1 | -5.86 | 25.755 |
| -2.920000000000151 | 1 | -5.84 | 25.579 |
| -2.910000000000151 | 1 | -5.82 | 25.404 |
| -2.900000000000151 | 1 | -5.8 | 25.23 |
| -2.890000000000151 | 1 | -5.78 | 25.056 |
| -2.880000000000152 | 1 | -5.76 | 24.883 |
| -2.870000000000152 | 1 | -5.74 | 24.711 |
| -2.860000000000152 | 1 | -5.72 | 24.539 |
| -2.850000000000152 | 1 | -5.7 | 24.368 |
| -2.840000000000153 | 1 | -5.68 | 24.197 |
| -2.830000000000153 | 1 | -5.66 | 24.027 |
| -2.820000000000153 | 1 | -5.64 | 23.857 |
| -2.810000000000153 | 1 | -5.62 | 23.688 |
| -2.800000000000153 | 1 | -5.6 | 23.52 |
| -2.790000000000154 | 1 | -5.58 | 23.352 |
| -2.780000000000154 | 1 | -5.56 | 23.185 |
| -2.770000000000154 | 1 | -5.54 | 23.019 |
| -2.760000000000154 | 1 | -5.52 | 22.853 |
| -2.750000000000154 | 1 | -5.5 | 22.688 |
| -2.740000000000155 | 1 | -5.48 | 22.523 |
| -2.730000000000155 | 1 | -5.46 | 22.359 |
| -2.720000000000155 | 1 | -5.44 | 22.195 |
| -2.710000000000155 | 1 | -5.42 | 22.032 |
| -2.700000000000156 | 1 | -5.4 | 21.87 |
| -2.690000000000156 | 1 | -5.38 | 21.708 |
| -2.680000000000156 | 1 | -5.36 | 21.547 |
| -2.670000000000156 | 1 | -5.34 | 21.387 |
| -2.660000000000156 | 1 | -5.32 | 21.227 |
| -2.650000000000157 | 1 | -5.3 | 21.068 |
| -2.640000000000157 | 1 | -5.28 | 20.909 |
| -2.630000000000157 | 1 | -5.26 | 20.751 |
| -2.620000000000157 | 1 | -5.24 | 20.593 |
| -2.610000000000157 | 1 | -5.22 | 20.436 |
| -2.600000000000158 | 1 | -5.2 | 20.28 |
| -2.590000000000158 | 1 | -5.18 | 20.124 |
| -2.580000000000158 | 1 | -5.16 | 19.969 |
| -2.570000000000158 | 1 | -5.14 | 19.815 |
| -2.560000000000159 | 1 | -5.12 | 19.661 |
| -2.550000000000159 | 1 | -5.1 | 19.508 |
| -2.54000000000016 | 1 | -5.08 | 19.355 |
| -2.530000000000159 | 1 | -5.06 | 19.203 |
| -2.520000000000159 | 1 | -5.04 | 19.051 |
| -2.51000000000016 | 1 | -5.02 | 18.9 |
| -2.50000000000016 | 1 | -5 | 18.75 |
| -2.49000000000016 | 1 | -4.98 | 18.6 |
| -2.48000000000016 | 1 | -4.96 | 18.451 |
| -2.47000000000016 | 1 | -4.94 | 18.303 |
| -2.460000000000161 | 1 | -4.92 | 18.155 |
| -2.450000000000161 | 1 | -4.9 | 18.008 |
| -2.440000000000161 | 1 | -4.88 | 17.861 |
| -2.430000000000161 | 1 | -4.86 | 17.715 |
| -2.420000000000162 | 1 | -4.84 | 17.569 |
| -2.410000000000162 | 1 | -4.82 | 17.424 |
| -2.400000000000162 | 1 | -4.8 | 17.28 |
| -2.390000000000162 | 1 | -4.78 | 17.136 |
| -2.380000000000162 | 1 | -4.76 | 16.993 |
| -2.370000000000163 | 1 | -4.74 | 16.851 |
| -2.360000000000163 | 1 | -4.72 | 16.709 |
| -2.350000000000163 | 1 | -4.7 | 16.568 |
| -2.340000000000163 | 1 | -4.68 | 16.427 |
| -2.330000000000163 | 1 | -4.66 | 16.287 |
| -2.320000000000164 | 1 | -4.64 | 16.147 |
| -2.310000000000164 | 1 | -4.62 | 16.008 |
| -2.300000000000164 | 1 | -4.6 | 15.87 |
| -2.290000000000164 | 1 | -4.58 | 15.732 |
| -2.280000000000165 | 1 | -4.56 | 15.595 |
| -2.270000000000165 | 1 | -4.54 | 15.459 |
| -2.260000000000165 | 1 | -4.52 | 15.323 |
| -2.250000000000165 | 1 | -4.5 | 15.188 |
| -2.240000000000165 | 1 | -4.48 | 15.053 |
| -2.230000000000166 | 1 | -4.46 | 14.919 |
| -2.220000000000166 | 1 | -4.44 | 14.785 |
| -2.210000000000166 | 1 | -4.42 | 14.652 |
| -2.200000000000166 | 1 | -4.4 | 14.52 |
| -2.190000000000166 | 1 | -4.38 | 14.388 |
| -2.180000000000167 | 1 | -4.36 | 14.257 |
| -2.170000000000167 | 1 | -4.34 | 14.127 |
| -2.160000000000167 | 1 | -4.32 | 13.997 |
| -2.150000000000167 | 1 | -4.3 | 13.868 |
| -2.140000000000168 | 1 | -4.28 | 13.739 |
| -2.130000000000168 | 1 | -4.26 | 13.611 |
| -2.120000000000168 | 1 | -4.24 | 13.483 |
| -2.110000000000168 | 1 | -4.22 | 13.356 |
| -2.100000000000168 | 1 | -4.2 | 13.23 |
| -2.090000000000169 | 1 | -4.18 | 13.104 |
| -2.080000000000169 | 1 | -4.16 | 12.979 |
| -2.070000000000169 | 1 | -4.14 | 12.855 |
| -2.060000000000169 | 1 | -4.12 | 12.731 |
| -2.050000000000169 | 1 | -4.1 | 12.608 |
| -2.04000000000017 | 1 | -4.08 | 12.485 |
| -2.03000000000017 | 1 | -4.06 | 12.363 |
| -2.02000000000017 | 1 | -4.04 | 12.241 |
| -2.01000000000017 | 1 | -4.02 | 12.12 |
| -2.000000000000171 | 1 | -4 | 12 |
| -1.99000000000017 | 1 | -3.98 | 11.88 |
| -1.98000000000017 | 1 | -3.96 | 11.761 |
| -1.97000000000017 | 1 | -3.94 | 11.643 |
| -1.96000000000017 | 1 | -3.92 | 11.525 |
| -1.95000000000017 | 1 | -3.9 | 11.408 |
| -1.94000000000017 | 1 | -3.88 | 11.291 |
| -1.93000000000017 | 1 | -3.86 | 11.175 |
| -1.92000000000017 | 1 | -3.84 | 11.059 |
| -1.91000000000017 | 1 | -3.82 | 10.944 |
| -1.90000000000017 | 1 | -3.8 | 10.83 |
| -1.89000000000017 | 1 | -3.78 | 10.716 |
| -1.88000000000017 | 1 | -3.76 | 10.603 |
| -1.87000000000017 | 1 | -3.74 | 10.491 |
| -1.86000000000017 | 1 | -3.72 | 10.379 |
| -1.85000000000017 | 1 | -3.7 | 10.268 |
| -1.84000000000017 | 1 | -3.68 | 10.157 |
| -1.83000000000017 | 1 | -3.66 | 10.047 |
| -1.82000000000017 | 1 | -3.64 | 9.937 |
| -1.81000000000017 | 1 | -3.62 | 9.828 |
| -1.80000000000017 | 1 | -3.6 | 9.72 |
| -1.79000000000017 | 1 | -3.58 | 9.612 |
| -1.78000000000017 | 1 | -3.56 | 9.505 |
| -1.77000000000017 | 1 | -3.54 | 9.399 |
| -1.76000000000017 | 1 | -3.52 | 9.293 |
| -1.75000000000017 | 1 | -3.5 | 9.188 |
| -1.74000000000017 | 1 | -3.48 | 9.083 |
| -1.73000000000017 | 1 | -3.46 | 8.979 |
| -1.72000000000017 | 1 | -3.44 | 8.875 |
| -1.71000000000017 | 1 | -3.42 | 8.772 |
| -1.70000000000017 | 1 | -3.4 | 8.67 |
| -1.69000000000017 | 1 | -3.38 | 8.568 |
| -1.68000000000017 | 1 | -3.36 | 8.467 |
| -1.67000000000017 | 1 | -3.34 | 8.367 |
| -1.66000000000017 | 1 | -3.32 | 8.267 |
| -1.65000000000017 | 1 | -3.3 | 8.168 |
| -1.64000000000017 | 1 | -3.28 | 8.069 |
| -1.63000000000017 | 1 | -3.26 | 7.971 |
| -1.62000000000017 | 1 | -3.24 | 7.873 |
| -1.61000000000017 | 1 | -3.22 | 7.776 |
| -1.60000000000017 | 1 | -3.2 | 7.68 |
| -1.59000000000017 | 1 | -3.18 | 7.584 |
| -1.58000000000017 | 1 | -3.16 | 7.489 |
| -1.57000000000017 | 1 | -3.14 | 7.395 |
| -1.56000000000017 | 1 | -3.12 | 7.301 |
| -1.55000000000017 | 1 | -3.1 | 7.208 |
| -1.54000000000017 | 1 | -3.08 | 7.115 |
| -1.53000000000017 | 1 | -3.06 | 7.023 |
| -1.52000000000017 | 1 | -3.04 | 6.931 |
| -1.51000000000017 | 1 | -3.02 | 6.84 |
| -1.50000000000017 | 1 | -3 | 6.75 |
| -1.49000000000017 | 1 | -2.98 | 6.66 |
| -1.48000000000017 | 1 | -2.96 | 6.571 |
| -1.47000000000017 | 1 | -2.94 | 6.483 |
| -1.46000000000017 | 1 | -2.92 | 6.395 |
| -1.45000000000017 | 1 | -2.9 | 6.308 |
| -1.44000000000017 | 1 | -2.88 | 6.221 |
| -1.43000000000017 | 1 | -2.86 | 6.135 |
| -1.42000000000017 | 1 | -2.84 | 6.049 |
| -1.41000000000017 | 1 | -2.82 | 5.964 |
| -1.40000000000017 | 1 | -2.8 | 5.88 |
| -1.39000000000017 | 1 | -2.78 | 5.796 |
| -1.38000000000017 | 1 | -2.76 | 5.713 |
| -1.37000000000017 | 1 | -2.74 | 5.631 |
| -1.36000000000017 | 1 | -2.72 | 5.549 |
| -1.35000000000017 | 1 | -2.7 | 5.468 |
| -1.34000000000017 | 1 | -2.68 | 5.387 |
| -1.33000000000017 | 1 | -2.66 | 5.307 |
| -1.32000000000017 | 1 | -2.64 | 5.227 |
| -1.31000000000017 | 1 | -2.62 | 5.148 |
| -1.30000000000017 | 1 | -2.6 | 5.07 |
| -1.29000000000017 | 1 | -2.58 | 4.992 |
| -1.28000000000017 | 1 | -2.56 | 4.915 |
| -1.27000000000017 | 1 | -2.54 | 4.839 |
| -1.26000000000017 | 1 | -2.52 | 4.763 |
| -1.25000000000017 | 1 | -2.5 | 4.688 |
| -1.24000000000017 | 1 | -2.48 | 4.613 |
| -1.23000000000017 | 1 | -2.46 | 4.539 |
| -1.22000000000017 | 1 | -2.44 | 4.465 |
| -1.21000000000017 | 1 | -2.42 | 4.392 |
| -1.20000000000017 | 1 | -2.4 | 4.32 |
| -1.19000000000017 | 1 | -2.38 | 4.248 |
| -1.18000000000017 | 1 | -2.36 | 4.177 |
| -1.17000000000017 | 1 | -2.34 | 4.107 |
| -1.16000000000017 | 1 | -2.32 | 4.037 |
| -1.15000000000017 | 1 | -2.3 | 3.968 |
| -1.14000000000017 | 1 | -2.28 | 3.899 |
| -1.13000000000017 | 1 | -2.26 | 3.831 |
| -1.12000000000017 | 1 | -2.24 | 3.763 |
| -1.11000000000017 | 1 | -2.22 | 3.696 |
| -1.10000000000017 | 1 | -2.2 | 3.63 |
| -1.09000000000017 | 1 | -2.18 | 3.564 |
| -1.08000000000017 | 1 | -2.16 | 3.499 |
| -1.07000000000017 | 1 | -2.14 | 3.435 |
| -1.06000000000017 | 1 | -2.12 | 3.371 |
| -1.05000000000017 | 1 | -2.1 | 3.308 |
| -1.04000000000017 | 1 | -2.08 | 3.245 |
| -1.03000000000017 | 1 | -2.06 | 3.183 |
| -1.02000000000017 | 1 | -2.04 | 3.121 |
| -1.01000000000017 | 1 | -2.02 | 3.06 |
| -1.00000000000017 | 1 | -2 | 3 |
| -0.99000000000017 | 1 | -1.98 | 2.94 |
| -0.98000000000017 | 1 | -1.96 | 2.881 |
| -0.97000000000017 | 1 | -1.94 | 2.823 |
| -0.96000000000017 | 1 | -1.92 | 2.765 |
| -0.95000000000017 | 1 | -1.9 | 2.708 |
| -0.94000000000017 | 1 | -1.88 | 2.651 |
| -0.93000000000017 | 1 | -1.86 | 2.595 |
| -0.92000000000017 | 1 | -1.84 | 2.539 |
| -0.91000000000017 | 1 | -1.82 | 2.484 |
| -0.90000000000017 | 1 | -1.8 | 2.43 |
| -0.890000000000169 | 1 | -1.78 | 2.376 |
| -0.880000000000169 | 1 | -1.76 | 2.323 |
| -0.870000000000169 | 1 | -1.74 | 2.271 |
| -0.860000000000169 | 1 | -1.72 | 2.219 |
| -0.850000000000169 | 1 | -1.7 | 2.168 |
| -0.840000000000169 | 1 | -1.68 | 2.117 |
| -0.830000000000169 | 1 | -1.66 | 2.067 |
| -0.820000000000169 | 1 | -1.64 | 2.017 |
| -0.810000000000169 | 1 | -1.62 | 1.968 |
| -0.800000000000169 | 1 | -1.6 | 1.92 |
| -0.790000000000169 | 1 | -1.58 | 1.872 |
| -0.780000000000169 | 1 | -1.56 | 1.825 |
| -0.770000000000169 | 1 | -1.54 | 1.779 |
| -0.760000000000169 | 1 | -1.52 | 1.733 |
| -0.750000000000169 | 1 | -1.5 | 1.688 |
| -0.740000000000169 | 1 | -1.48 | 1.643 |
| -0.730000000000169 | 1 | -1.46 | 1.599 |
| -0.720000000000169 | 1 | -1.44 | 1.555 |
| -0.710000000000169 | 1 | -1.42 | 1.512 |
| -0.700000000000169 | 1 | -1.4 | 1.47 |
| -0.690000000000169 | 1 | -1.38 | 1.428 |
| -0.680000000000169 | 1 | -1.36 | 1.387 |
| -0.670000000000169 | 1 | -1.34 | 1.347 |
| -0.660000000000169 | 1 | -1.32 | 1.307 |
| -0.650000000000169 | 1 | -1.3 | 1.268 |
| -0.640000000000169 | 1 | -1.28 | 1.229 |
| -0.630000000000169 | 1 | -1.26 | 1.191 |
| -0.620000000000169 | 1 | -1.24 | 1.153 |
| -0.610000000000169 | 1 | -1.22 | 1.116 |
| -0.600000000000169 | 1 | -1.2 | 1.08 |
| -0.590000000000169 | 1 | -1.18 | 1.044 |
| -0.580000000000169 | 1 | -1.16 | 1.009 |
| -0.570000000000169 | 1 | -1.14 | 0.975 |
| -0.560000000000169 | 1 | -1.12 | 0.941 |
| -0.550000000000169 | 1 | -1.1 | 0.908 |
| -0.540000000000169 | 1 | -1.08 | 0.875 |
| -0.530000000000169 | 1 | -1.06 | 0.843 |
| -0.520000000000169 | 1 | -1.04 | 0.811 |
| -0.510000000000169 | 1 | -1.02 | 0.78 |
| -0.500000000000169 | 1 | -1 | 0.75 |
| -0.490000000000169 | 1 | -0.98 | 0.72 |
| -0.480000000000169 | 1 | -0.96 | 0.691 |
| -0.470000000000169 | 1 | -0.94 | 0.663 |
| -0.460000000000169 | 1 | -0.92 | 0.635 |
| -0.450000000000169 | 1 | -0.9 | 0.608 |
| -0.440000000000169 | 1 | -0.88 | 0.581 |
| -0.430000000000169 | 1 | -0.86 | 0.555 |
| -0.420000000000169 | 1 | -0.84 | 0.529 |
| -0.410000000000169 | 1 | -0.82 | 0.504 |
| -0.400000000000169 | 1 | -0.8 | 0.48 |
| -0.390000000000169 | 1 | -0.78 | 0.456 |
| -0.380000000000169 | 1 | -0.76 | 0.433 |
| -0.370000000000169 | 1 | -0.74 | 0.411 |
| -0.360000000000169 | 1 | -0.72 | 0.389 |
| -0.350000000000169 | 1 | -0.7 | 0.368 |
| -0.340000000000169 | 1 | -0.68 | 0.347 |
| -0.330000000000169 | 1 | -0.66 | 0.327 |
| -0.320000000000169 | 1 | -0.64 | 0.307 |
| -0.310000000000169 | 1 | -0.62 | 0.288 |
| -0.300000000000169 | 1 | -0.6 | 0.27 |
| -0.290000000000169 | 1 | -0.58 | 0.252 |
| -0.280000000000169 | 1 | -0.56 | 0.235 |
| -0.270000000000169 | 1 | -0.54 | 0.219 |
| -0.260000000000169 | 1 | -0.52 | 0.203 |
| -0.250000000000169 | 1 | -0.5 | 0.188 |
| -0.240000000000169 | 1 | -0.48 | 0.173 |
| -0.230000000000169 | 1 | -0.46 | 0.159 |
| -0.220000000000169 | 1 | -0.44 | 0.145 |
| -0.210000000000169 | 1 | -0.42 | 0.132 |
| -0.200000000000169 | 1 | -0.4 | 0.12 |
| -0.190000000000169 | 1 | -0.38 | 0.108 |
| -0.180000000000169 | 1 | -0.36 | 0.097 |
| -0.170000000000169 | 1 | -0.34 | 0.087 |
| -0.160000000000169 | 1 | -0.32 | 0.077 |
| -0.150000000000169 | 1 | -0.3 | 0.068 |
| -0.140000000000169 | 1 | -0.28 | 0.059 |
| -0.130000000000169 | 1 | -0.26 | 0.051 |
| -0.120000000000169 | 1 | -0.24 | 0.043 |
| -0.110000000000169 | 1 | -0.22 | 0.036 |
| -0.100000000000169 | 1 | -0.2 | 0.03 |
| -0.0900000000001689 | 1 | -0.18 | 0.024 |
| -0.0800000000001689 | 1 | -0.16 | 0.019 |
| -0.0700000000001689 | 1 | -0.14 | 0.015 |
| -0.0600000000001689 | 1 | -0.12 | 0.011 |
| -0.0500000000001689 | 1 | -0.1 | 0.008 |
| -0.0400000000001689 | 1 | -0.08 | 0.005 |
| -0.0300000000001689 | 1 | -0.06 | 0.003 |
| -0.0200000000001689 | 1 | -0.04 | 0.001 |
| -0.0100000000001689 | 1 | -0.02 | 0 |
| -1.6888920817415e-13 | 1 | 0 | 0 |
| 0.00999999999983111 | 1 | 0.02 | 0 |
| 0.0199999999998311 | 1 | 0.04 | 0.001 |
| 0.0299999999998311 | 1 | 0.06 | 0.003 |
| 0.0399999999998311 | 1 | 0.08 | 0.005 |
| 0.0499999999998311 | 1 | 0.1 | 0.007 |
| 0.0599999999998311 | 1 | 0.12 | 0.011 |
| 0.0699999999998311 | 1 | 0.14 | 0.015 |
| 0.0799999999998311 | 1 | 0.16 | 0.019 |
| 0.0899999999998311 | 1 | 0.18 | 0.024 |
| 0.0999999999998311 | 1 | 0.2 | 0.03 |
| 0.109999999999831 | 1 | 0.22 | 0.036 |
| 0.119999999999831 | 1 | 0.24 | 0.043 |
| 0.129999999999831 | 1 | 0.26 | 0.051 |
| 0.139999999999831 | 1 | 0.28 | 0.059 |
| 0.149999999999831 | 1 | 0.3 | 0.067 |
| 0.159999999999831 | 1 | 0.32 | 0.077 |
| 0.169999999999831 | 1 | 0.34 | 0.087 |
| 0.179999999999831 | 1 | 0.36 | 0.097 |
| 0.189999999999831 | 1 | 0.38 | 0.108 |
| 0.199999999999831 | 1 | 0.4 | 0.12 |
| 0.209999999999831 | 1 | 0.42 | 0.132 |
| 0.219999999999831 | 1 | 0.44 | 0.145 |
| 0.229999999999831 | 1 | 0.46 | 0.159 |
| 0.239999999999831 | 1 | 0.48 | 0.173 |
| 0.249999999999831 | 1 | 0.5 | 0.187 |
| 0.259999999999831 | 1 | 0.52 | 0.203 |
| 0.269999999999831 | 1 | 0.54 | 0.219 |
| 0.279999999999831 | 1 | 0.56 | 0.235 |
| 0.289999999999831 | 1 | 0.58 | 0.252 |
| 0.299999999999831 | 1 | 0.6 | 0.27 |
| 0.309999999999831 | 1 | 0.62 | 0.288 |
| 0.319999999999831 | 1 | 0.64 | 0.307 |
| 0.329999999999831 | 1 | 0.66 | 0.327 |
| 0.339999999999831 | 1 | 0.68 | 0.347 |
| 0.349999999999831 | 1 | 0.7 | 0.367 |
| 0.359999999999831 | 1 | 0.72 | 0.389 |
| 0.369999999999831 | 1 | 0.74 | 0.411 |
| 0.379999999999831 | 1 | 0.76 | 0.433 |
| 0.389999999999831 | 1 | 0.78 | 0.456 |
| 0.399999999999831 | 1 | 0.8 | 0.48 |
| 0.409999999999831 | 1 | 0.82 | 0.504 |
| 0.419999999999831 | 1 | 0.84 | 0.529 |
| 0.429999999999831 | 1 | 0.86 | 0.555 |
| 0.439999999999831 | 1 | 0.88 | 0.581 |
| 0.449999999999831 | 1 | 0.9 | 0.607 |
| 0.459999999999831 | 1 | 0.92 | 0.635 |
| 0.469999999999831 | 1 | 0.94 | 0.663 |
| 0.479999999999831 | 1 | 0.96 | 0.691 |
| 0.489999999999831 | 1 | 0.98 | 0.72 |
| 0.499999999999831 | 1 | 1 | 0.75 |
| 0.509999999999831 | 1 | 1.02 | 0.78 |
| 0.519999999999831 | 1 | 1.04 | 0.811 |
| 0.529999999999831 | 1 | 1.06 | 0.843 |
| 0.539999999999831 | 1 | 1.08 | 0.875 |
| 0.549999999999831 | 1 | 1.1 | 0.907 |
| 0.559999999999831 | 1 | 1.12 | 0.941 |
| 0.569999999999831 | 1 | 1.14 | 0.975 |
| 0.579999999999831 | 1 | 1.16 | 1.009 |
| 0.589999999999831 | 1 | 1.18 | 1.044 |
| 0.599999999999831 | 1 | 1.2 | 1.08 |
| 0.609999999999831 | 1 | 1.22 | 1.116 |
| 0.619999999999831 | 1 | 1.24 | 1.153 |
| 0.629999999999831 | 1 | 1.26 | 1.191 |
| 0.639999999999831 | 1 | 1.28 | 1.229 |
| 0.649999999999831 | 1 | 1.3 | 1.267 |
| 0.659999999999831 | 1 | 1.32 | 1.307 |
| 0.669999999999831 | 1 | 1.34 | 1.347 |
| 0.679999999999831 | 1 | 1.36 | 1.387 |
| 0.689999999999831 | 1 | 1.38 | 1.428 |
| 0.699999999999831 | 1 | 1.4 | 1.47 |
| 0.709999999999831 | 1 | 1.42 | 1.512 |
| 0.719999999999831 | 1 | 1.44 | 1.555 |
| 0.729999999999831 | 1 | 1.46 | 1.599 |
| 0.739999999999831 | 1 | 1.48 | 1.643 |
| 0.749999999999832 | 1 | 1.5 | 1.687 |
| 0.759999999999832 | 1 | 1.52 | 1.733 |
| 0.769999999999832 | 1 | 1.54 | 1.779 |
| 0.779999999999832 | 1 | 1.56 | 1.825 |
| 0.789999999999832 | 1 | 1.58 | 1.872 |
| 0.799999999999832 | 1 | 1.6 | 1.92 |
| 0.809999999999832 | 1 | 1.62 | 1.968 |
| 0.819999999999832 | 1 | 1.64 | 2.017 |
| 0.829999999999832 | 1 | 1.66 | 2.067 |
| 0.839999999999832 | 1 | 1.68 | 2.117 |
| 0.849999999999832 | 1 | 1.7 | 2.167 |
| 0.859999999999832 | 1 | 1.72 | 2.219 |
| 0.869999999999832 | 1 | 1.74 | 2.271 |
| 0.879999999999832 | 1 | 1.76 | 2.323 |
| 0.889999999999832 | 1 | 1.78 | 2.376 |
| 0.899999999999832 | 1 | 1.8 | 2.43 |
| 0.909999999999832 | 1 | 1.82 | 2.484 |
| 0.919999999999832 | 1 | 1.84 | 2.539 |
| 0.929999999999832 | 1 | 1.86 | 2.595 |
| 0.939999999999832 | 1 | 1.88 | 2.651 |
| 0.949999999999832 | 1 | 1.9 | 2.707 |
| 0.959999999999832 | 1 | 1.92 | 2.765 |
| 0.969999999999832 | 1 | 1.94 | 2.823 |
| 0.979999999999832 | 1 | 1.96 | 2.881 |
| 0.989999999999832 | 1 | 1.98 | 2.94 |
| 0.999999999999832 | 1 | 2 | 3 |
| 1.009999999999832 | 1 | 2.02 | 3.06 |
| 1.019999999999832 | 1 | 2.04 | 3.121 |
| 1.029999999999832 | 1 | 2.06 | 3.183 |
| 1.039999999999832 | 1 | 2.08 | 3.245 |
| 1.049999999999832 | 1 | 2.1 | 3.307 |
| 1.059999999999832 | 1 | 2.12 | 3.371 |
| 1.069999999999832 | 1 | 2.14 | 3.435 |
| 1.079999999999832 | 1 | 2.16 | 3.499 |
| 1.089999999999832 | 1 | 2.18 | 3.564 |
| 1.099999999999832 | 1 | 2.2 | 3.63 |
| 1.109999999999832 | 1 | 2.22 | 3.696 |
| 1.119999999999832 | 1 | 2.24 | 3.763 |
| 1.129999999999832 | 1 | 2.26 | 3.831 |
| 1.139999999999832 | 1 | 2.28 | 3.899 |
| 1.149999999999832 | 1 | 2.3 | 3.967 |
| 1.159999999999832 | 1 | 2.32 | 4.037 |
| 1.169999999999832 | 1 | 2.34 | 4.107 |
| 1.179999999999832 | 1 | 2.36 | 4.177 |
| 1.189999999999832 | 1 | 2.38 | 4.248 |
| 1.199999999999832 | 1 | 2.4 | 4.32 |
| 1.209999999999832 | 1 | 2.42 | 4.392 |
| 1.219999999999832 | 1 | 2.44 | 4.465 |
| 1.229999999999832 | 1 | 2.46 | 4.539 |
| 1.239999999999832 | 1 | 2.48 | 4.613 |
| 1.249999999999832 | 1 | 2.5 | 4.687 |
| 1.259999999999832 | 1 | 2.52 | 4.763 |
| 1.269999999999832 | 1 | 2.54 | 4.839 |
| 1.279999999999832 | 1 | 2.56 | 4.915 |
| 1.289999999999832 | 1 | 2.58 | 4.992 |
| 1.299999999999832 | 1 | 2.6 | 5.07 |
| 1.309999999999832 | 1 | 2.62 | 5.148 |
| 1.319999999999832 | 1 | 2.64 | 5.227 |
| 1.329999999999832 | 1 | 2.66 | 5.307 |
| 1.339999999999832 | 1 | 2.68 | 5.387 |
| 1.349999999999832 | 1 | 2.7 | 5.467 |
| 1.359999999999832 | 1 | 2.72 | 5.549 |
| 1.369999999999832 | 1 | 2.74 | 5.631 |
| 1.379999999999832 | 1 | 2.76 | 5.713 |
| 1.389999999999832 | 1 | 2.78 | 5.796 |
| 1.399999999999832 | 1 | 2.8 | 5.88 |
| 1.409999999999832 | 1 | 2.82 | 5.964 |
| 1.419999999999832 | 1 | 2.84 | 6.049 |
| 1.429999999999832 | 1 | 2.86 | 6.135 |
| 1.439999999999832 | 1 | 2.88 | 6.221 |
| 1.449999999999832 | 1 | 2.9 | 6.307 |
| 1.459999999999832 | 1 | 2.92 | 6.395 |
| 1.469999999999832 | 1 | 2.94 | 6.483 |
| 1.479999999999832 | 1 | 2.96 | 6.571 |
| 1.489999999999832 | 1 | 2.98 | 6.66 |
| 1.499999999999832 | 1 | 3 | 6.75 |
| 1.509999999999832 | 1 | 3.02 | 6.84 |
| 1.519999999999832 | 1 | 3.04 | 6.931 |
| 1.529999999999832 | 1 | 3.06 | 7.023 |
| 1.539999999999832 | 1 | 3.08 | 7.115 |
| 1.549999999999832 | 1 | 3.1 | 7.207 |
| 1.559999999999832 | 1 | 3.12 | 7.301 |
| 1.569999999999832 | 1 | 3.14 | 7.395 |
| 1.579999999999832 | 1 | 3.16 | 7.489 |
| 1.589999999999832 | 1 | 3.18 | 7.584 |
| 1.599999999999832 | 1 | 3.2 | 7.68 |
| 1.609999999999832 | 1 | 3.22 | 7.776 |
| 1.619999999999832 | 1 | 3.24 | 7.873 |
| 1.629999999999832 | 1 | 3.26 | 7.971 |
| 1.639999999999832 | 1 | 3.28 | 8.069 |
| 1.649999999999832 | 1 | 3.3 | 8.167 |
| 1.659999999999832 | 1 | 3.32 | 8.267 |
| 1.669999999999832 | 1 | 3.34 | 8.367 |
| 1.679999999999832 | 1 | 3.36 | 8.467 |
| 1.689999999999832 | 1 | 3.38 | 8.568 |
| 1.699999999999832 | 1 | 3.4 | 8.67 |
| 1.709999999999832 | 1 | 3.42 | 8.772 |
| 1.719999999999832 | 1 | 3.44 | 8.875 |
| 1.729999999999832 | 1 | 3.46 | 8.979 |
| 1.739999999999832 | 1 | 3.48 | 9.083 |
| 1.749999999999832 | 1 | 3.5 | 9.187 |
| 1.759999999999832 | 1 | 3.52 | 9.293 |
| 1.769999999999832 | 1 | 3.54 | 9.399 |
| 1.779999999999832 | 1 | 3.56 | 9.505 |
| 1.789999999999832 | 1 | 3.58 | 9.612 |
| 1.799999999999832 | 1 | 3.6 | 9.72 |
| 1.809999999999832 | 1 | 3.62 | 9.828 |
| 1.819999999999832 | 1 | 3.64 | 9.937 |
| 1.829999999999832 | 1 | 3.66 | 10.047 |
| 1.839999999999832 | 1 | 3.68 | 10.157 |
| 1.849999999999832 | 1 | 3.7 | 10.267 |
| 1.859999999999832 | 1 | 3.72 | 10.379 |
| 1.869999999999832 | 1 | 3.74 | 10.491 |
| 1.879999999999832 | 1 | 3.76 | 10.603 |
| 1.889999999999832 | 1 | 3.78 | 10.716 |
| 1.899999999999832 | 1 | 3.8 | 10.83 |
| 1.909999999999832 | 1 | 3.82 | 10.944 |
| 1.919999999999832 | 1 | 3.84 | 11.059 |
| 1.929999999999832 | 1 | 3.86 | 11.175 |
| 1.939999999999832 | 1 | 3.88 | 11.291 |
| 1.949999999999833 | 1 | 3.9 | 11.407 |
| 1.959999999999833 | 1 | 3.92 | 11.525 |
| 1.969999999999833 | 1 | 3.94 | 11.643 |
| 1.979999999999833 | 1 | 3.96 | 11.761 |
| 1.989999999999833 | 1 | 3.98 | 11.88 |
| 1.999999999999833 | 1 | 4 | 12 |
| 2.009999999999832 | 1 | 4.02 | 12.12 |
| 2.019999999999832 | 1 | 4.04 | 12.241 |
| 2.029999999999832 | 1 | 4.06 | 12.363 |
| 2.039999999999832 | 1 | 4.08 | 12.485 |
| 2.049999999999832 | 1 | 4.1 | 12.607 |
| 2.059999999999831 | 1 | 4.12 | 12.731 |
| 2.069999999999831 | 1 | 4.14 | 12.855 |
| 2.079999999999831 | 1 | 4.16 | 12.979 |
| 2.089999999999831 | 1 | 4.18 | 13.104 |
| 2.09999999999983 | 1 | 4.2 | 13.23 |
| 2.10999999999983 | 1 | 4.22 | 13.356 |
| 2.11999999999983 | 1 | 4.24 | 13.483 |
| 2.12999999999983 | 1 | 4.26 | 13.611 |
| 2.13999999999983 | 1 | 4.28 | 13.739 |
| 2.149999999999829 | 1 | 4.3 | 13.867 |
| 2.159999999999829 | 1 | 4.32 | 13.997 |
| 2.169999999999829 | 1 | 4.34 | 14.127 |
| 2.179999999999829 | 1 | 4.36 | 14.257 |
| 2.189999999999829 | 1 | 4.38 | 14.388 |
| 2.199999999999828 | 1 | 4.4 | 14.52 |
| 2.209999999999828 | 1 | 4.42 | 14.652 |
| 2.219999999999828 | 1 | 4.44 | 14.785 |
| 2.229999999999828 | 1 | 4.46 | 14.919 |
| 2.239999999999827 | 1 | 4.48 | 15.053 |
| 2.249999999999827 | 1 | 4.5 | 15.187 |
| 2.259999999999827 | 1 | 4.52 | 15.323 |
| 2.269999999999827 | 1 | 4.54 | 15.459 |
| 2.279999999999827 | 1 | 4.56 | 15.595 |
| 2.289999999999826 | 1 | 4.58 | 15.732 |
| 2.299999999999826 | 1 | 4.6 | 15.87 |
| 2.309999999999826 | 1 | 4.62 | 16.008 |
| 2.319999999999826 | 1 | 4.64 | 16.147 |
| 2.329999999999825 | 1 | 4.66 | 16.287 |
| 2.339999999999825 | 1 | 4.68 | 16.427 |
| 2.349999999999825 | 1 | 4.7 | 16.567 |
| 2.359999999999825 | 1 | 4.72 | 16.709 |
| 2.369999999999825 | 1 | 4.74 | 16.851 |
| 2.379999999999824 | 1 | 4.76 | 16.993 |
| 2.389999999999824 | 1 | 4.78 | 17.136 |
| 2.399999999999824 | 1 | 4.8 | 17.28 |
| 2.409999999999824 | 1 | 4.82 | 17.424 |
| 2.419999999999824 | 1 | 4.84 | 17.569 |
| 2.429999999999823 | 1 | 4.86 | 17.715 |
| 2.439999999999823 | 1 | 4.88 | 17.861 |
| 2.449999999999823 | 1 | 4.9 | 18.007 |
| 2.459999999999823 | 1 | 4.92 | 18.155 |
| 2.469999999999823 | 1 | 4.94 | 18.303 |
| 2.479999999999822 | 1 | 4.96 | 18.451 |
| 2.489999999999822 | 1 | 4.98 | 18.6 |
| 2.499999999999822 | 1 | 5 | 18.75 |
| 2.509999999999822 | 1 | 5.02 | 18.9 |
| 2.519999999999821 | 1 | 5.04 | 19.051 |
| 2.529999999999821 | 1 | 5.06 | 19.203 |
| 2.539999999999821 | 1 | 5.08 | 19.355 |
| 2.549999999999821 | 1 | 5.1 | 19.507 |
| 2.559999999999821 | 1 | 5.12 | 19.661 |
| 2.56999999999982 | 1 | 5.14 | 19.815 |
| 2.57999999999982 | 1 | 5.16 | 19.969 |
| 2.58999999999982 | 1 | 5.18 | 20.124 |
| 2.59999999999982 | 1 | 5.2 | 20.28 |
| 2.609999999999819 | 1 | 5.22 | 20.436 |
| 2.619999999999819 | 1 | 5.24 | 20.593 |
| 2.629999999999819 | 1 | 5.26 | 20.751 |
| 2.639999999999819 | 1 | 5.28 | 20.909 |
| 2.649999999999819 | 1 | 5.3 | 21.067 |
| 2.659999999999818 | 1 | 5.32 | 21.227 |
| 2.669999999999818 | 1 | 5.34 | 21.387 |
| 2.679999999999818 | 1 | 5.36 | 21.547 |
| 2.689999999999818 | 1 | 5.38 | 21.708 |
| 2.699999999999818 | 1 | 5.4 | 21.87 |
| 2.709999999999817 | 1 | 5.42 | 22.032 |
| 2.719999999999817 | 1 | 5.44 | 22.195 |
| 2.729999999999817 | 1 | 5.46 | 22.359 |
| 2.739999999999817 | 1 | 5.48 | 22.523 |
| 2.749999999999817 | 1 | 5.5 | 22.687 |
| 2.759999999999816 | 1 | 5.52 | 22.853 |
| 2.769999999999816 | 1 | 5.54 | 23.019 |
| 2.779999999999816 | 1 | 5.56 | 23.185 |
| 2.789999999999816 | 1 | 5.58 | 23.352 |
| 2.799999999999815 | 1 | 5.6 | 23.52 |
| 2.809999999999815 | 1 | 5.62 | 23.688 |
| 2.819999999999815 | 1 | 5.64 | 23.857 |
| 2.829999999999815 | 1 | 5.66 | 24.027 |
| 2.839999999999815 | 1 | 5.68 | 24.197 |
| 2.849999999999814 | 1 | 5.7 | 24.367 |
| 2.859999999999814 | 1 | 5.72 | 24.539 |
| 2.869999999999814 | 1 | 5.74 | 24.711 |
| 2.879999999999814 | 1 | 5.76 | 24.883 |
| 2.889999999999814 | 1 | 5.78 | 25.056 |
| 2.899999999999813 | 1 | 5.8 | 25.23 |
| 2.909999999999813 | 1 | 5.82 | 25.404 |
| 2.919999999999813 | 1 | 5.84 | 25.579 |
| 2.929999999999813 | 1 | 5.86 | 25.755 |
| 2.939999999999813 | 1 | 5.88 | 25.931 |
| 2.949999999999812 | 1 | 5.9 | 26.107 |
| 2.959999999999812 | 1 | 5.92 | 26.285 |
| 2.969999999999812 | 1 | 5.94 | 26.463 |
| 2.979999999999812 | 1 | 5.96 | 26.641 |
| 2.989999999999811 | 1 | 5.98 | 26.82 |
| 2.999999999999811 | 1 | 6 | 27 |
| 3.009999999999811 | 1 | 6.02 | 27.18 |
| 3.019999999999811 | 1 | 6.04 | 27.361 |
| 3.029999999999811 | 1 | 6.06 | 27.543 |
| 3.03999999999981 | 1 | 6.08 | 27.725 |
| 3.04999999999981 | 1 | 6.1 | 27.907 |
| 3.05999999999981 | 1 | 6.12 | 28.091 |
| 3.06999999999981 | 1 | 6.14 | 28.275 |
| 3.07999999999981 | 1 | 6.16 | 28.459 |
| 3.089999999999809 | 1 | 6.18 | 28.644 |
| 3.099999999999809 | 1 | 6.2 | 28.83 |
| 3.109999999999809 | 1 | 6.22 | 29.016 |
| 3.119999999999809 | 1 | 6.24 | 29.203 |
| 3.129999999999808 | 1 | 6.26 | 29.391 |
| 3.139999999999808 | 1 | 6.28 | 29.579 |
| 3.149999999999808 | 1 | 6.3 | 29.767 |
| 3.159999999999808 | 1 | 6.32 | 29.957 |
| 3.169999999999808 | 1 | 6.34 | 30.147 |
| 3.179999999999807 | 1 | 6.36 | 30.337 |
| 3.189999999999807 | 1 | 6.38 | 30.528 |
| 3.199999999999807 | 1 | 6.4 | 30.72 |
| 3.209999999999807 | 1 | 6.42 | 30.912 |
| 3.219999999999807 | 1 | 6.44 | 31.105 |
| 3.229999999999806 | 1 | 6.46 | 31.299 |
| 3.239999999999806 | 1 | 6.48 | 31.493 |
| 3.249999999999806 | 1 | 6.5 | 31.687 |
| 3.259999999999806 | 1 | 6.52 | 31.883 |
| 3.269999999999805 | 1 | 6.54 | 32.079 |
| 3.279999999999805 | 1 | 6.56 | 32.275 |
| 3.289999999999805 | 1 | 6.58 | 32.472 |
| 3.299999999999805 | 1 | 6.6 | 32.67 |
| 3.309999999999805 | 1 | 6.62 | 32.868 |
| 3.319999999999804 | 1 | 6.64 | 33.067 |
| 3.329999999999804 | 1 | 6.66 | 33.267 |
| 3.339999999999804 | 1 | 6.68 | 33.467 |
| 3.349999999999804 | 1 | 6.7 | 33.667 |
| 3.359999999999804 | 1 | 6.72 | 33.869 |
| 3.369999999999803 | 1 | 6.74 | 34.071 |
| 3.379999999999803 | 1 | 6.76 | 34.273 |
| 3.389999999999803 | 1 | 6.78 | 34.476 |
| 3.399999999999803 | 1 | 6.8 | 34.68 |
| 3.409999999999802 | 1 | 6.82 | 34.884 |
| 3.419999999999802 | 1 | 6.84 | 35.089 |
| 3.429999999999802 | 1 | 6.86 | 35.295 |
| 3.439999999999802 | 1 | 6.88 | 35.501 |
| 3.449999999999802 | 1 | 6.9 | 35.707 |
| 3.459999999999801 | 1 | 6.92 | 35.915 |
| 3.469999999999801 | 1 | 6.94 | 36.123 |
| 3.479999999999801 | 1 | 6.96 | 36.331 |
| 3.489999999999801 | 1 | 6.98 | 36.54 |
| 3.499999999999801 | 1 | 7 | 36.75 |
| 3.5099999999998 | 1 | 7.02 | 36.96 |
| 3.5199999999998 | 1 | 7.04 | 37.171 |
| 3.5299999999998 | 1 | 7.06 | 37.383 |
| 3.5399999999998 | 1 | 7.08 | 37.595 |
| 3.5499999999998 | 1 | 7.1 | 37.807 |
| 3.559999999999799 | 1 | 7.12 | 38.021 |
| 3.569999999999799 | 1 | 7.14 | 38.235 |
| 3.579999999999799 | 1 | 7.16 | 38.449 |
| 3.589999999999799 | 1 | 7.18 | 38.664 |
| 3.599999999999798 | 1 | 7.2 | 38.88 |
| 3.609999999999798 | 1 | 7.22 | 39.096 |
| 3.619999999999798 | 1 | 7.24 | 39.313 |
| 3.629999999999798 | 1 | 7.26 | 39.531 |
| 3.639999999999798 | 1 | 7.28 | 39.749 |
| 3.649999999999797 | 1 | 7.3 | 39.967 |
| 3.659999999999797 | 1 | 7.32 | 40.187 |
| 3.669999999999797 | 1 | 7.34 | 40.407 |
| 3.679999999999797 | 1 | 7.36 | 40.627 |
| 3.689999999999796 | 1 | 7.38 | 40.848 |
| 3.699999999999796 | 1 | 7.4 | 41.07 |
| 3.709999999999796 | 1 | 7.42 | 41.292 |
| 3.719999999999796 | 1 | 7.44 | 41.515 |
| 3.729999999999796 | 1 | 7.46 | 41.739 |
| 3.739999999999795 | 1 | 7.48 | 41.963 |
| 3.749999999999795 | 1 | 7.5 | 42.187 |
| 3.759999999999795 | 1 | 7.52 | 42.413 |
| 3.769999999999795 | 1 | 7.54 | 42.639 |
| 3.779999999999795 | 1 | 7.56 | 42.865 |
| 3.789999999999794 | 1 | 7.58 | 43.092 |
| 3.799999999999794 | 1 | 7.6 | 43.32 |
| 3.809999999999794 | 1 | 7.62 | 43.548 |
| 3.819999999999794 | 1 | 7.64 | 43.777 |
| 3.829999999999794 | 1 | 7.66 | 44.007 |
| 3.839999999999793 | 1 | 7.68 | 44.237 |
| 3.849999999999793 | 1 | 7.7 | 44.467 |
| 3.859999999999793 | 1 | 7.72 | 44.699 |
| 3.869999999999793 | 1 | 7.74 | 44.931 |
| 3.879999999999792 | 1 | 7.76 | 45.163 |
| 3.889999999999792 | 1 | 7.78 | 45.396 |
| 3.899999999999792 | 1 | 7.8 | 45.63 |
| 3.909999999999792 | 1 | 7.82 | 45.864 |
| 3.919999999999792 | 1 | 7.84 | 46.099 |
| 3.929999999999791 | 1 | 7.86 | 46.335 |
| 3.939999999999791 | 1 | 7.88 | 46.571 |
| 3.949999999999791 | 1 | 7.9 | 46.807 |
| 3.959999999999791 | 1 | 7.92 | 47.045 |
| 3.969999999999791 | 1 | 7.94 | 47.283 |
| 3.97999999999979 | 1 | 7.96 | 47.521 |
| 3.98999999999979 | 1 | 7.98 | 47.76 |
| 3.99999999999979 | 1 | 8 | 48 |
| 4.00999999999979 | 1 | 8.02 | 48.24 |
| 4.01999999999979 | 1 | 8.04 | 48.481 |
| 4.02999999999979 | 1 | 8.06 | 48.723 |
| 4.03999999999979 | 1 | 8.08 | 48.965 |
| 4.04999999999979 | 1 | 8.1 | 49.207 |
| 4.05999999999979 | 1 | 8.12 | 49.451 |
| 4.069999999999789 | 1 | 8.14 | 49.695 |
| 4.079999999999788 | 1 | 8.16 | 49.939 |
| 4.089999999999788 | 1 | 8.18 | 50.184 |
| 4.099999999999788 | 1 | 8.2 | 50.43 |
| 4.109999999999788 | 1 | 8.22 | 50.676 |
| 4.119999999999788 | 1 | 8.24 | 50.923 |
| 4.129999999999788 | 1 | 8.26 | 51.171 |
| 4.139999999999787 | 1 | 8.28 | 51.419 |
| 4.149999999999787 | 1 | 8.3 | 51.667 |
| 4.159999999999787 | 1 | 8.32 | 51.917 |
| 4.169999999999787 | 1 | 8.34 | 52.167 |
| 4.179999999999786 | 1 | 8.36 | 52.417 |
| 4.189999999999786 | 1 | 8.38 | 52.668 |
| 4.199999999999786 | 1 | 8.4 | 52.92 |
| 4.209999999999785 | 1 | 8.42 | 53.172 |
| 4.219999999999785 | 1 | 8.44 | 53.425 |
| 4.229999999999785 | 1 | 8.46 | 53.679 |
| 4.239999999999785 | 1 | 8.48 | 53.933 |
| 4.249999999999785 | 1 | 8.5 | 54.187 |
| 4.259999999999784 | 1 | 8.52 | 54.443 |
| 4.269999999999784 | 1 | 8.54 | 54.699 |
| 4.279999999999784 | 1 | 8.56 | 54.955 |
| 4.289999999999784 | 1 | 8.58 | 55.212 |
| 4.299999999999784 | 1 | 8.6 | 55.47 |
| 4.309999999999784 | 1 | 8.62 | 55.728 |
| 4.319999999999784 | 1 | 8.64 | 55.987 |
| 4.329999999999783 | 1 | 8.66 | 56.247 |
| 4.339999999999783 | 1 | 8.68 | 56.507 |
| 4.349999999999783 | 1 | 8.7 | 56.767 |
| 4.359999999999783 | 1 | 8.72 | 57.029 |
| 4.369999999999782 | 1 | 8.74 | 57.291 |
| 4.379999999999782 | 1 | 8.76 | 57.553 |
| 4.389999999999782 | 1 | 8.78 | 57.816 |
| 4.399999999999782 | 1 | 8.8 | 58.08 |
| 4.409999999999781 | 1 | 8.82 | 58.344 |
| 4.419999999999781 | 1 | 8.84 | 58.609 |
| 4.429999999999781 | 1 | 8.86 | 58.875 |
| 4.43999999999978 | 1 | 8.88 | 59.141 |
| 4.44999999999978 | 1 | 8.9 | 59.407 |
| 4.45999999999978 | 1 | 8.92 | 59.675 |
| 4.46999999999978 | 1 | 8.94 | 59.943 |
| 4.47999999999978 | 1 | 8.96 | 60.211 |
| 4.48999999999978 | 1 | 8.98 | 60.48 |
| 4.49999999999978 | 1 | 9 | 60.75 |
| 4.50999999999978 | 1 | 9.02 | 61.02 |
| 4.51999999999978 | 1 | 9.04 | 61.291 |
| 4.52999999999978 | 1 | 9.06 | 61.563 |
| 4.539999999999778 | 1 | 9.08 | 61.835 |
| 4.549999999999778 | 1 | 9.1 | 62.107 |
| 4.559999999999778 | 1 | 9.12 | 62.381 |
| 4.569999999999778 | 1 | 9.14 | 62.655 |
| 4.579999999999778 | 1 | 9.16 | 62.929 |
| 4.589999999999777 | 1 | 9.18 | 63.204 |
| 4.599999999999777 | 1 | 9.2 | 63.48 |
| 4.609999999999777 | 1 | 9.22 | 63.756 |
| 4.619999999999777 | 1 | 9.24 | 64.033 |
| 4.629999999999777 | 1 | 9.26 | 64.311 |
| 4.639999999999776 | 1 | 9.28 | 64.589 |
| 4.649999999999776 | 1 | 9.3 | 64.867 |
| 4.659999999999776 | 1 | 9.32 | 65.147 |
| 4.669999999999776 | 1 | 9.34 | 65.427 |
| 4.679999999999775 | 1 | 9.36 | 65.707 |
| 4.689999999999775 | 1 | 9.38 | 65.988 |
| 4.699999999999775 | 1 | 9.4 | 66.27 |
| 4.709999999999775 | 1 | 9.42 | 66.552 |
| 4.719999999999774 | 1 | 9.44 | 66.835 |
| 4.729999999999774 | 1 | 9.46 | 67.119 |
| 4.739999999999774 | 1 | 9.48 | 67.403 |
| 4.749999999999774 | 1 | 9.5 | 67.687 |
| 4.759999999999774 | 1 | 9.52 | 67.973 |
| 4.769999999999774 | 1 | 9.54 | 68.259 |
| 4.779999999999773 | 1 | 9.56 | 68.545 |
| 4.789999999999773 | 1 | 9.58 | 68.832 |
| 4.799999999999773 | 1 | 9.6 | 69.12 |
| 4.809999999999773 | 1 | 9.62 | 69.408 |
| 4.819999999999773 | 1 | 9.64 | 69.697 |
| 4.829999999999773 | 1 | 9.66 | 69.987 |
| 4.839999999999772 | 1 | 9.68 | 70.277 |
| 4.849999999999772 | 1 | 9.7 | 70.567 |
| 4.859999999999772 | 1 | 9.72 | 70.859 |
| 4.869999999999772 | 1 | 9.74 | 71.151 |
| 4.879999999999771 | 1 | 9.76 | 71.443 |
| 4.889999999999771 | 1 | 9.78 | 71.736 |
| 4.899999999999771 | 1 | 9.8 | 72.03 |
| 4.90999999999977 | 1 | 9.82 | 72.324 |
| 4.91999999999977 | 1 | 9.84 | 72.619 |
| 4.92999999999977 | 1 | 9.86 | 72.915 |
| 4.93999999999977 | 1 | 9.88 | 73.211 |
| 4.94999999999977 | 1 | 9.9 | 73.507 |
| 4.95999999999977 | 1 | 9.92 | 73.805 |
| 4.96999999999977 | 1 | 9.94 | 74.103 |
| 4.97999999999977 | 1 | 9.96 | 74.401 |
| 4.98999999999977 | 1 | 9.98 | 74.7 |
| 4.99999999999977 | 1 | 10 | 75 |
| 5.009999999999768 | 1 | 10.02 | 75.3 |
| 5.019999999999768 | 1 | 10.04 | 75.601 |
| 5.029999999999768 | 1 | 10.06 | 75.903 |
| 5.039999999999768 | 1 | 10.08 | 76.205 |
| 5.049999999999767 | 1 | 10.1 | 76.507 |
| 5.059999999999767 | 1 | 10.12 | 76.811 |
| 5.069999999999767 | 1 | 10.14 | 77.115 |
| 5.079999999999767 | 1 | 10.16 | 77.419 |
| 5.089999999999767 | 1 | 10.18 | 77.724 |
| 5.099999999999766 | 1 | 10.2 | 78.03 |
| 5.109999999999766 | 1 | 10.22 | 78.336 |
| 5.119999999999766 | 1 | 10.24 | 78.643 |
| 5.129999999999766 | 1 | 10.26 | 78.951 |
| 5.139999999999766 | 1 | 10.28 | 79.259 |
| 5.149999999999765 | 1 | 10.3 | 79.567 |
| 5.159999999999765 | 1 | 10.32 | 79.877 |
| 5.169999999999765 | 1 | 10.34 | 80.187 |
| 5.179999999999765 | 1 | 10.36 | 80.497 |
| 5.189999999999764 | 1 | 10.38 | 80.808 |
| 5.199999999999764 | 1 | 10.4 | 81.12 |
| 5.209999999999764 | 1 | 10.42 | 81.432 |
| 5.219999999999764 | 1 | 10.44 | 81.745 |
| 5.229999999999764 | 1 | 10.46 | 82.059 |
| 5.239999999999763 | 1 | 10.48 | 82.373 |
| 5.249999999999763 | 1 | 10.5 | 82.687 |
| 5.259999999999763 | 1 | 10.52 | 83.003 |
| 5.269999999999763 | 1 | 10.54 | 83.319 |
| 5.279999999999763 | 1 | 10.56 | 83.635 |
| 5.289999999999762 | 1 | 10.58 | 83.952 |
| 5.299999999999762 | 1 | 10.6 | 84.27 |
| 5.309999999999762 | 1 | 10.62 | 84.588 |
| 5.319999999999762 | 1 | 10.64 | 84.907 |
| 5.329999999999762 | 1 | 10.66 | 85.227 |
| 5.339999999999761 | 1 | 10.68 | 85.547 |
| 5.349999999999761 | 1 | 10.7 | 85.867 |
| 5.359999999999761 | 1 | 10.72 | 86.189 |
| 5.369999999999761 | 1 | 10.74 | 86.511 |
| 5.37999999999976 | 1 | 10.76 | 86.833 |
| 5.38999999999976 | 1 | 10.78 | 87.156 |
| 5.39999999999976 | 1 | 10.8 | 87.48 |
| 5.40999999999976 | 1 | 10.82 | 87.804 |
| 5.41999999999976 | 1 | 10.84 | 88.129 |
| 5.42999999999976 | 1 | 10.86 | 88.455 |
| 5.43999999999976 | 1 | 10.88 | 88.781 |
| 5.44999999999976 | 1 | 10.9 | 89.107 |
| 5.45999999999976 | 1 | 10.92 | 89.435 |
| 5.46999999999976 | 1 | 10.94 | 89.763 |
| 5.479999999999758 | 1 | 10.96 | 90.091 |
| 5.489999999999758 | 1 | 10.98 | 90.42 |
| 5.499999999999758 | 1 | 11 | 90.75 |
| 5.509999999999758 | 1 | 11.02 | 91.08 |
| 5.519999999999758 | 1 | 11.04 | 91.411 |
| 5.529999999999758 | 1 | 11.06 | 91.743 |
| 5.539999999999757 | 1 | 11.08 | 92.075 |
| 5.549999999999757 | 1 | 11.1 | 92.407 |
| 5.559999999999757 | 1 | 11.12 | 92.741 |
| 5.569999999999757 | 1 | 11.14 | 93.075 |
| 5.579999999999756 | 1 | 11.16 | 93.409 |
| 5.589999999999756 | 1 | 11.18 | 93.744 |
| 5.599999999999756 | 1 | 11.2 | 94.08 |
| 5.609999999999756 | 1 | 11.22 | 94.416 |
| 5.619999999999756 | 1 | 11.24 | 94.753 |
| 5.629999999999756 | 1 | 11.26 | 95.091 |
| 5.639999999999755 | 1 | 11.28 | 95.429 |
| 5.649999999999755 | 1 | 11.3 | 95.767 |
| 5.659999999999755 | 1 | 11.32 | 96.107 |
| 5.669999999999755 | 1 | 11.34 | 96.447 |
| 5.679999999999754 | 1 | 11.36 | 96.787 |
| 5.689999999999754 | 1 | 11.38 | 97.128 |
| 5.699999999999754 | 1 | 11.4 | 97.47 |
| 5.709999999999754 | 1 | 11.42 | 97.812 |
| 5.719999999999754 | 1 | 11.44 | 98.155 |
| 5.729999999999753 | 1 | 11.46 | 98.499 |
| 5.739999999999753 | 1 | 11.48 | 98.843 |
| 5.749999999999753 | 1 | 11.5 | 99.187 |
| 5.759999999999753 | 1 | 11.52 | 99.533 |
| 5.769999999999753 | 1 | 11.54 | 99.879 |
| 5.779999999999752 | 1 | 11.56 | 100.225 |
| 5.789999999999752 | 1 | 11.58 | 100.572 |
| 5.799999999999752 | 1 | 11.6 | 100.92 |
| 5.809999999999752 | 1 | 11.62 | 101.268 |
| 5.819999999999752 | 1 | 11.64 | 101.617 |
| 5.829999999999751 | 1 | 11.66 | 101.967 |
| 5.839999999999751 | 1 | 11.68 | 102.317 |
| 5.849999999999751 | 1 | 11.7 | 102.667 |
| 5.859999999999751 | 1 | 11.72 | 103.019 |
| 5.86999999999975 | 1 | 11.74 | 103.371 |
| 5.87999999999975 | 1 | 11.76 | 103.723 |
| 5.88999999999975 | 1 | 11.78 | 104.076 |
| 5.89999999999975 | 1 | 11.8 | 104.43 |
| 5.90999999999975 | 1 | 11.82 | 104.784 |
| 5.91999999999975 | 1 | 11.84 | 105.139 |
| 5.92999999999975 | 1 | 11.86 | 105.495 |
| 5.93999999999975 | 1 | 11.88 | 105.851 |
| 5.949999999999748 | 1 | 11.9 | 106.207 |
| 5.959999999999748 | 1 | 11.92 | 106.565 |
| 5.969999999999748 | 1 | 11.94 | 106.923 |
| 5.979999999999748 | 1 | 11.96 | 107.281 |
| 5.989999999999747 | 1 | 11.98 | 107.64 |
| 5.999999999999747 | 1 | 12 | 108 |
| 6.009999999999747 | 1 | 12.02 | 108.36 |
| 6.019999999999747 | 1 | 12.04 | 108.721 |
| 6.029999999999747 | 1 | 12.06 | 109.083 |
| 6.039999999999746 | 1 | 12.08 | 109.445 |
| 6.049999999999746 | 1 | 12.1 | 109.807 |
| 6.059999999999746 | 1 | 12.12 | 110.171 |
| 6.069999999999746 | 1 | 12.14 | 110.535 |
| 6.079999999999746 | 1 | 12.16 | 110.899 |
| 6.089999999999745 | 1 | 12.18 | 111.264 |
| 6.099999999999745 | 1 | 12.2 | 111.63 |
| 6.109999999999745 | 1 | 12.22 | 111.996 |
| 6.119999999999745 | 1 | 12.24 | 112.363 |
| 6.129999999999745 | 1 | 12.26 | 112.731 |
| 6.139999999999744 | 1 | 12.28 | 113.099 |
| 6.149999999999744 | 1 | 12.3 | 113.467 |
| 6.159999999999744 | 1 | 12.32 | 113.837 |
| 6.169999999999744 | 1 | 12.34 | 114.207 |
| 6.179999999999744 | 1 | 12.36 | 114.577 |
| 6.189999999999744 | 1 | 12.38 | 114.948 |
| 6.199999999999743 | 1 | 12.4 | 115.32 |
| 6.209999999999743 | 1 | 12.42 | 115.692 |
| 6.219999999999743 | 1 | 12.44 | 116.065 |
| 6.229999999999743 | 1 | 12.46 | 116.439 |
| 6.239999999999742 | 1 | 12.48 | 116.813 |
| 6.249999999999742 | 1 | 12.5 | 117.187 |
| 6.259999999999742 | 1 | 12.52 | 117.563 |
| 6.269999999999742 | 1 | 12.54 | 117.939 |
| 6.279999999999741 | 1 | 12.56 | 118.315 |
| 6.289999999999741 | 1 | 12.58 | 118.692 |
| 6.299999999999741 | 1 | 12.6 | 119.07 |
| 6.309999999999741 | 1 | 12.62 | 119.448 |
| 6.319999999999741 | 1 | 12.64 | 119.827 |
| 6.329999999999741 | 1 | 12.66 | 120.207 |
| 6.33999999999974 | 1 | 12.68 | 120.587 |
| 6.34999999999974 | 1 | 12.7 | 120.967 |
| 6.35999999999974 | 1 | 12.72 | 121.349 |
| 6.36999999999974 | 1 | 12.74 | 121.731 |
| 6.37999999999974 | 1 | 12.76 | 122.113 |
| 6.38999999999974 | 1 | 12.78 | 122.496 |
| 6.39999999999974 | 1 | 12.8 | 122.88 |
| 6.409999999999738 | 1 | 12.82 | 123.264 |
| 6.419999999999738 | 1 | 12.84 | 123.649 |
| 6.429999999999738 | 1 | 12.86 | 124.035 |
| 6.439999999999738 | 1 | 12.88 | 124.421 |
| 6.449999999999738 | 1 | 12.9 | 124.807 |
| 6.459999999999737 | 1 | 12.92 | 125.195 |
| 6.469999999999737 | 1 | 12.94 | 125.583 |
| 6.479999999999737 | 1 | 12.96 | 125.971 |
| 6.489999999999737 | 1 | 12.98 | 126.36 |
| 6.499999999999737 | 1 | 13 | 126.75 |
| 6.509999999999736 | 1 | 13.02 | 127.14 |
| 6.519999999999736 | 1 | 13.04 | 127.531 |
| 6.529999999999736 | 1 | 13.06 | 127.923 |
| 6.539999999999736 | 1 | 13.08 | 128.315 |
| 6.549999999999736 | 1 | 13.1 | 128.707 |
| 6.559999999999735 | 1 | 13.12 | 129.101 |
| 6.569999999999735 | 1 | 13.14 | 129.495 |
| 6.579999999999735 | 1 | 13.16 | 129.889 |
| 6.589999999999735 | 1 | 13.18 | 130.284 |
| 6.599999999999734 | 1 | 13.2 | 130.68 |
| 6.609999999999734 | 1 | 13.22 | 131.076 |
| 6.619999999999734 | 1 | 13.24 | 131.473 |
| 6.629999999999734 | 1 | 13.26 | 131.871 |
| 6.639999999999734 | 1 | 13.28 | 132.269 |
| 6.649999999999734 | 1 | 13.3 | 132.667 |
| 6.659999999999734 | 1 | 13.32 | 133.067 |
| 6.669999999999733 | 1 | 13.34 | 133.467 |
| 6.679999999999733 | 1 | 13.36 | 133.867 |
| 6.689999999999733 | 1 | 13.38 | 134.268 |
| 6.699999999999733 | 1 | 13.4 | 134.67 |
| 6.709999999999732 | 1 | 13.42 | 135.072 |
| 6.719999999999732 | 1 | 13.44 | 135.475 |
| 6.729999999999732 | 1 | 13.46 | 135.879 |
| 6.739999999999731 | 1 | 13.48 | 136.283 |
| 6.749999999999731 | 1 | 13.5 | 136.687 |
| 6.759999999999731 | 1 | 13.52 | 137.093 |
| 6.769999999999731 | 1 | 13.54 | 137.499 |
| 6.77999999999973 | 1 | 13.56 | 137.905 |
| 6.78999999999973 | 1 | 13.58 | 138.312 |
| 6.79999999999973 | 1 | 13.6 | 138.72 |
| 6.80999999999973 | 1 | 13.62 | 139.128 |
| 6.81999999999973 | 1 | 13.64 | 139.537 |
| 6.82999999999973 | 1 | 13.66 | 139.947 |
| 6.83999999999973 | 1 | 13.68 | 140.357 |
| 6.84999999999973 | 1 | 13.7 | 140.767 |
| 6.85999999999973 | 1 | 13.72 | 141.179 |
| 6.86999999999973 | 1 | 13.74 | 141.591 |
| 6.879999999999728 | 1 | 13.76 | 142.003 |
| 6.889999999999728 | 1 | 13.78 | 142.416 |
| 6.899999999999728 | 1 | 13.8 | 142.83 |
| 6.909999999999728 | 1 | 13.82 | 143.244 |
| 6.919999999999728 | 1 | 13.84 | 143.659 |
| 6.929999999999727 | 1 | 13.86 | 144.075 |
| 6.939999999999727 | 1 | 13.88 | 144.491 |
| 6.949999999999727 | 1 | 13.9 | 144.907 |
| 6.959999999999727 | 1 | 13.92 | 145.325 |
| 6.969999999999727 | 1 | 13.94 | 145.743 |
| 6.979999999999726 | 1 | 13.96 | 146.161 |
| 6.989999999999726 | 1 | 13.98 | 146.58 |
| 6.999999999999726 | 1 | 14 | 147 |
| 7.009999999999726 | 1 | 14.02 | 147.42 |
| 7.019999999999726 | 1 | 14.04 | 147.841 |
| 7.029999999999725 | 1 | 14.06 | 148.263 |
| 7.039999999999725 | 1 | 14.08 | 148.685 |
| 7.049999999999725 | 1 | 14.1 | 149.107 |
| 7.059999999999725 | 1 | 14.12 | 149.531 |
| 7.069999999999724 | 1 | 14.14 | 149.955 |
| 7.079999999999724 | 1 | 14.16 | 150.379 |
| 7.089999999999724 | 1 | 14.18 | 150.804 |
| 7.099999999999724 | 1 | 14.2 | 151.23 |
| 7.109999999999724 | 1 | 14.22 | 151.656 |
| 7.119999999999724 | 1 | 14.24 | 152.083 |
| 7.129999999999724 | 1 | 14.26 | 152.511 |
| 7.139999999999723 | 1 | 14.28 | 152.939 |
| 7.149999999999723 | 1 | 14.3 | 153.367 |
| 7.159999999999723 | 1 | 14.32 | 153.797 |
| 7.169999999999723 | 1 | 14.34 | 154.227 |
| 7.179999999999722 | 1 | 14.36 | 154.657 |
| 7.189999999999722 | 1 | 14.38 | 155.088 |
| 7.199999999999722 | 1 | 14.4 | 155.52 |
| 7.209999999999721 | 1 | 14.42 | 155.952 |
| 7.219999999999721 | 1 | 14.44 | 156.385 |
| 7.229999999999721 | 1 | 14.46 | 156.819 |
| 7.23999999999972 | 1 | 14.48 | 157.253 |
| 7.24999999999972 | 1 | 14.5 | 157.687 |
| 7.25999999999972 | 1 | 14.52 | 158.123 |
| 7.26999999999972 | 1 | 14.54 | 158.559 |
| 7.27999999999972 | 1 | 14.56 | 158.995 |
| 7.28999999999972 | 1 | 14.58 | 159.432 |
| 7.29999999999972 | 1 | 14.6 | 159.87 |
| 7.30999999999972 | 1 | 14.62 | 160.308 |
| 7.31999999999972 | 1 | 14.64 | 160.747 |
| 7.329999999999719 | 1 | 14.66 | 161.187 |
| 7.33999999999972 | 1 | 14.68 | 161.627 |
| 7.349999999999719 | 1 | 14.7 | 162.067 |
| 7.359999999999719 | 1 | 14.72 | 162.509 |
| 7.369999999999718 | 1 | 14.74 | 162.951 |
| 7.379999999999718 | 1 | 14.76 | 163.393 |
| 7.389999999999718 | 1 | 14.78 | 163.836 |
| 7.399999999999718 | 1 | 14.8 | 164.28 |
| 7.409999999999717 | 1 | 14.82 | 164.724 |
| 7.419999999999717 | 1 | 14.84 | 165.169 |
| 7.429999999999717 | 1 | 14.86 | 165.615 |
| 7.439999999999717 | 1 | 14.88 | 166.061 |
| 7.449999999999716 | 1 | 14.9 | 166.507 |
| 7.459999999999716 | 1 | 14.92 | 166.955 |
| 7.469999999999716 | 1 | 14.94 | 167.403 |
| 7.479999999999716 | 1 | 14.96 | 167.851 |
| 7.489999999999715 | 1 | 14.98 | 168.3 |
| 7.499999999999715 | 1 | 15 | 168.75 |
| 7.509999999999715 | 1 | 15.02 | 169.2 |
| 7.519999999999715 | 1 | 15.04 | 169.651 |
| 7.529999999999715 | 1 | 15.06 | 170.103 |
| 7.539999999999714 | 1 | 15.08 | 170.555 |
| 7.549999999999714 | 1 | 15.1 | 171.007 |
| 7.559999999999714 | 1 | 15.12 | 171.461 |
| 7.569999999999714 | 1 | 15.14 | 171.915 |
| 7.579999999999714 | 1 | 15.16 | 172.369 |
| 7.589999999999714 | 1 | 15.18 | 172.824 |
| 7.599999999999714 | 1 | 15.2 | 173.28 |
| 7.609999999999713 | 1 | 15.22 | 173.736 |
| 7.619999999999713 | 1 | 15.24 | 174.193 |
| 7.629999999999713 | 1 | 15.26 | 174.651 |
| 7.639999999999713 | 1 | 15.28 | 175.109 |
| 7.649999999999712 | 1 | 15.3 | 175.567 |
| 7.659999999999712 | 1 | 15.32 | 176.027 |
| 7.669999999999712 | 1 | 15.34 | 176.487 |
| 7.679999999999712 | 1 | 15.36 | 176.947 |
| 7.689999999999712 | 1 | 15.38 | 177.408 |
| 7.699999999999711 | 1 | 15.4 | 177.87 |
| 7.709999999999711 | 1 | 15.42 | 178.332 |
| 7.719999999999711 | 1 | 15.44 | 178.795 |
| 7.729999999999711 | 1 | 15.46 | 179.259 |
| 7.73999999999971 | 1 | 15.48 | 179.723 |
| 7.74999999999971 | 1 | 15.5 | 180.187 |
| 7.75999999999971 | 1 | 15.52 | 180.653 |
| 7.76999999999971 | 1 | 15.54 | 181.119 |
| 7.77999999999971 | 1 | 15.56 | 181.585 |
| 7.78999999999971 | 1 | 15.58 | 182.052 |
| 7.79999999999971 | 1 | 15.6 | 182.52 |
| 7.80999999999971 | 1 | 15.62 | 182.988 |
| 7.819999999999709 | 1 | 15.64 | 183.457 |
| 7.829999999999709 | 1 | 15.66 | 183.927 |
| 7.839999999999708 | 1 | 15.68 | 184.397 |
| 7.849999999999708 | 1 | 15.7 | 184.867 |
| 7.859999999999708 | 1 | 15.72 | 185.339 |
| 7.869999999999708 | 1 | 15.74 | 185.811 |
| 7.879999999999707 | 1 | 15.76 | 186.283 |
| 7.889999999999707 | 1 | 15.78 | 186.756 |
| 7.899999999999707 | 1 | 15.8 | 187.23 |
| 7.909999999999707 | 1 | 15.82 | 187.704 |
| 7.919999999999706 | 1 | 15.84 | 188.179 |
| 7.929999999999706 | 1 | 15.86 | 188.655 |
| 7.939999999999706 | 1 | 15.88 | 189.131 |
| 7.949999999999706 | 1 | 15.9 | 189.607 |
| 7.959999999999705 | 1 | 15.92 | 190.085 |
| 7.969999999999705 | 1 | 15.94 | 190.563 |
| 7.979999999999705 | 1 | 15.96 | 191.041 |
| 7.989999999999705 | 1 | 15.98 | 191.52 |
| 7.999999999999705 | 1 | 16 | 192 |
| 8.009999999999703 | 1 | 16.02 | 192.48 |
| 8.019999999999705 | 1 | 16.04 | 192.961 |
| 8.029999999999704 | 1 | 16.06 | 193.443 |
| 8.039999999999704 | 1 | 16.08 | 193.925 |
| 8.049999999999704 | 1 | 16.1 | 194.407 |
| 8.059999999999704 | 1 | 16.12 | 194.891 |
| 8.069999999999704 | 1 | 16.14 | 195.375 |
| 8.079999999999703 | 1 | 16.16 | 195.859 |
| 8.089999999999703 | 1 | 16.18 | 196.344 |
| 8.099999999999701 | 1 | 16.2 | 196.83 |
| 8.109999999999703 | 1 | 16.22 | 197.316 |
| 8.119999999999703 | 1 | 16.24 | 197.803 |
| 8.129999999999702 | 1 | 16.26 | 198.291 |
| 8.139999999999702 | 1 | 16.28 | 198.779 |
| 8.1499999999997 | 1 | 16.3 | 199.267 |
| 8.1599999999997 | 1 | 16.32 | 199.757 |
| 8.1699999999997 | 1 | 16.34 | 200.247 |
| 8.1799999999997 | 1 | 16.36 | 200.737 |
| 8.1899999999997 | 1 | 16.38 | 201.228 |
| 8.1999999999997 | 1 | 16.4 | 201.72 |
| 8.2099999999997 | 1 | 16.42 | 202.212 |
| 8.2199999999997 | 1 | 16.44 | 202.705 |
| 8.2299999999997 | 1 | 16.46 | 203.199 |
| 8.2399999999997 | 1 | 16.48 | 203.693 |
| 8.2499999999997 | 1 | 16.5 | 204.187 |
| 8.2599999999997 | 1 | 16.52 | 204.683 |
| 8.2699999999997 | 1 | 16.54 | 205.179 |
| 8.2799999999997 | 1 | 16.56 | 205.675 |
| 8.289999999999697 | 1 | 16.58 | 206.172 |
| 8.299999999999699 | 1 | 16.6 | 206.67 |
| 8.309999999999699 | 1 | 16.62 | 207.168 |
| 8.319999999999698 | 1 | 16.64 | 207.667 |
| 8.329999999999698 | 1 | 16.66 | 208.167 |
| 8.339999999999698 | 1 | 16.68 | 208.667 |
| 8.349999999999698 | 1 | 16.7 | 209.167 |
| 8.359999999999697 | 1 | 16.72 | 209.669 |
| 8.369999999999697 | 1 | 16.74 | 210.171 |
| 8.379999999999695 | 1 | 16.76 | 210.673 |
| 8.389999999999697 | 1 | 16.78 | 211.176 |
| 8.399999999999697 | 1 | 16.8 | 211.68 |
| 8.409999999999696 | 1 | 16.82 | 212.184 |
| 8.419999999999696 | 1 | 16.84 | 212.689 |
| 8.429999999999694 | 1 | 16.86 | 213.195 |
| 8.439999999999696 | 1 | 16.88 | 213.701 |
| 8.449999999999696 | 1 | 16.9 | 214.207 |
| 8.459999999999695 | 1 | 16.92 | 214.715 |
| 8.469999999999695 | 1 | 16.94 | 215.223 |
| 8.479999999999693 | 1 | 16.96 | 215.731 |
| 8.489999999999695 | 1 | 16.98 | 216.24 |
| 8.499999999999694 | 1 | 17 | 216.75 |
| 8.509999999999694 | 1 | 17.02 | 217.26 |
| 8.519999999999694 | 1 | 17.04 | 217.771 |
| 8.529999999999694 | 1 | 17.06 | 218.283 |
| 8.539999999999694 | 1 | 17.08 | 218.795 |
| 8.549999999999693 | 1 | 17.1 | 219.307 |
| 8.55999999999969 | 1 | 17.12 | 219.821 |
| 8.56999999999969 | 1 | 17.14 | 220.335 |
| 8.57999999999969 | 1 | 17.16 | 220.849 |
| 8.58999999999969 | 1 | 17.18 | 221.364 |
| 8.59999999999969 | 1 | 17.2 | 221.88 |
| 8.60999999999969 | 1 | 17.22 | 222.396 |
| 8.61999999999969 | 1 | 17.24 | 222.913 |
| 8.62999999999969 | 1 | 17.26 | 223.431 |
| 8.63999999999969 | 1 | 17.28 | 223.949 |
| 8.64999999999969 | 1 | 17.3 | 224.467 |
| 8.65999999999969 | 1 | 17.32 | 224.987 |
| 8.66999999999969 | 1 | 17.34 | 225.507 |
| 8.67999999999969 | 1 | 17.36 | 226.027 |
| 8.68999999999969 | 1 | 17.38 | 226.548 |
| 8.69999999999969 | 1 | 17.4 | 227.07 |
| 8.70999999999969 | 1 | 17.42 | 227.592 |
| 8.71999999999969 | 1 | 17.44 | 228.115 |
| 8.72999999999969 | 1 | 17.46 | 228.639 |
| 8.73999999999969 | 1 | 17.48 | 229.163 |
| 8.74999999999969 | 1 | 17.5 | 229.687 |
| 8.759999999999687 | 1 | 17.52 | 230.213 |
| 8.769999999999689 | 1 | 17.54 | 230.739 |
| 8.779999999999688 | 1 | 17.56 | 231.265 |
| 8.789999999999688 | 1 | 17.58 | 231.792 |
| 8.799999999999686 | 1 | 17.6 | 232.32 |
| 8.809999999999688 | 1 | 17.62 | 232.848 |
| 8.819999999999688 | 1 | 17.64 | 233.377 |
| 8.829999999999687 | 1 | 17.66 | 233.907 |
| 8.839999999999687 | 1 | 17.68 | 234.437 |
| 8.849999999999685 | 1 | 17.7 | 234.967 |
| 8.859999999999687 | 1 | 17.72 | 235.499 |
| 8.869999999999687 | 1 | 17.74 | 236.031 |
| 8.879999999999686 | 1 | 17.76 | 236.563 |
| 8.889999999999686 | 1 | 17.78 | 237.096 |
| 8.899999999999684 | 1 | 17.8 | 237.63 |
| 8.909999999999686 | 1 | 17.82 | 238.164 |
| 8.919999999999686 | 1 | 17.84 | 238.699 |
| 8.929999999999685 | 1 | 17.86 | 239.235 |
| 8.939999999999685 | 1 | 17.88 | 239.771 |
| 8.949999999999685 | 1 | 17.9 | 240.307 |
| 8.959999999999685 | 1 | 17.92 | 240.845 |
| 8.969999999999684 | 1 | 17.94 | 241.383 |
| 8.979999999999684 | 1 | 17.96 | 241.921 |
| 8.989999999999682 | 1 | 17.98 | 242.46 |
| 8.999999999999684 | 1 | 18 | 243 |
| 9.009999999999684 | 1 | 18.02 | 243.54 |
| 9.019999999999683 | 1 | 18.04 | 244.081 |
| 9.029999999999683 | 1 | 18.06 | 244.623 |
| 9.039999999999681 | 1 | 18.08 | 245.165 |
| 9.049999999999683 | 1 | 18.1 | 245.707 |
| 9.05999999999968 | 1 | 18.12 | 246.251 |
| 9.06999999999968 | 1 | 18.14 | 246.795 |
| 9.07999999999968 | 1 | 18.16 | 247.339 |
| 9.08999999999968 | 1 | 18.18 | 247.884 |
| 9.09999999999968 | 1 | 18.2 | 248.43 |
| 9.10999999999968 | 1 | 18.22 | 248.976 |
| 9.11999999999968 | 1 | 18.24 | 249.523 |
| 9.12999999999968 | 1 | 18.26 | 250.071 |
| 9.13999999999968 | 1 | 18.28 | 250.619 |
| 9.14999999999968 | 1 | 18.3 | 251.167 |
| 9.15999999999968 | 1 | 18.32 | 251.717 |
| 9.16999999999968 | 1 | 18.34 | 252.267 |
| 9.17999999999968 | 1 | 18.36 | 252.817 |
| 9.18999999999968 | 1 | 18.38 | 253.368 |
| 9.19999999999968 | 1 | 18.4 | 253.92 |
| 9.20999999999968 | 1 | 18.42 | 254.472 |
| 9.21999999999968 | 1 | 18.44 | 255.025 |
| 9.229999999999677 | 1 | 18.46 | 255.579 |
| 9.239999999999679 | 1 | 18.48 | 256.133 |
| 9.249999999999678 | 1 | 18.5 | 256.687 |
| 9.259999999999678 | 1 | 18.52 | 257.243 |
| 9.269999999999678 | 1 | 18.54 | 257.799 |
| 9.279999999999678 | 1 | 18.56 | 258.355 |
| 9.289999999999678 | 1 | 18.58 | 258.912 |
| 9.299999999999677 | 1 | 18.6 | 259.47 |
| 9.309999999999677 | 1 | 18.62 | 260.028 |
| 9.319999999999675 | 1 | 18.64 | 260.587 |
| 9.329999999999677 | 1 | 18.66 | 261.147 |
| 9.339999999999677 | 1 | 18.68 | 261.707 |
| 9.349999999999676 | 1 | 18.7 | 262.267 |
| 9.359999999999676 | 1 | 18.72 | 262.829 |
| 9.369999999999674 | 1 | 18.74 | 263.391 |
| 9.379999999999676 | 1 | 18.76 | 263.953 |
| 9.389999999999675 | 1 | 18.78 | 264.516 |
| 9.399999999999675 | 1 | 18.8 | 265.08 |
| 9.409999999999675 | 1 | 18.82 | 265.644 |
| 9.419999999999675 | 1 | 18.84 | 266.209 |
| 9.429999999999675 | 1 | 18.86 | 266.775 |
| 9.439999999999674 | 1 | 18.88 | 267.341 |
| 9.449999999999674 | 1 | 18.9 | 267.907 |
| 9.459999999999672 | 1 | 18.92 | 268.475 |
| 9.469999999999674 | 1 | 18.94 | 269.043 |
| 9.479999999999674 | 1 | 18.96 | 269.611 |
| 9.489999999999673 | 1 | 18.98 | 270.18 |
| 9.499999999999673 | 1 | 19 | 270.75 |
| 9.509999999999671 | 1 | 19.02 | 271.32 |
| 9.519999999999673 | 1 | 19.04 | 271.891 |
| 9.529999999999673 | 1 | 19.06 | 272.463 |
| 9.539999999999672 | 1 | 19.08 | 273.035 |
| 9.549999999999672 | 1 | 19.1 | 273.607 |
| 9.55999999999967 | 1 | 19.12 | 274.181 |
| 9.56999999999967 | 1 | 19.14 | 274.755 |
| 9.57999999999967 | 1 | 19.16 | 275.329 |
| 9.58999999999967 | 1 | 19.18 | 275.904 |
| 9.59999999999967 | 1 | 19.2 | 276.48 |
| 9.60999999999967 | 1 | 19.22 | 277.056 |
| 9.61999999999967 | 1 | 19.24 | 277.633 |
| 9.62999999999967 | 1 | 19.26 | 278.211 |
| 9.63999999999967 | 1 | 19.28 | 278.789 |
| 9.64999999999967 | 1 | 19.3 | 279.367 |
| 9.65999999999967 | 1 | 19.32 | 279.947 |
| 9.66999999999967 | 1 | 19.34 | 280.527 |
| 9.67999999999967 | 1 | 19.36 | 281.107 |
| 9.689999999999667 | 1 | 19.38 | 281.688 |
| 9.699999999999669 | 1 | 19.4 | 282.27 |
| 9.709999999999669 | 1 | 19.42 | 282.852 |
| 9.719999999999668 | 1 | 19.44 | 283.435 |
| 9.729999999999668 | 1 | 19.46 | 284.019 |
| 9.739999999999666 | 1 | 19.48 | 284.603 |
| 9.749999999999668 | 1 | 19.5 | 285.187 |
| 9.759999999999668 | 1 | 19.52 | 285.773 |
| 9.769999999999667 | 1 | 19.54 | 286.359 |
| 9.779999999999667 | 1 | 19.56 | 286.945 |
| 9.789999999999665 | 1 | 19.58 | 287.532 |
| 9.799999999999667 | 1 | 19.6 | 288.12 |
| 9.809999999999667 | 1 | 19.62 | 288.708 |
| 9.819999999999666 | 1 | 19.64 | 289.297 |
| 9.829999999999666 | 1 | 19.66 | 289.887 |
| 9.839999999999664 | 1 | 19.68 | 290.477 |
| 9.849999999999666 | 1 | 19.7 | 291.067 |
| 9.859999999999665 | 1 | 19.72 | 291.659 |
| 9.869999999999665 | 1 | 19.74 | 292.251 |
| 9.879999999999663 | 1 | 19.76 | 292.843 |
| 9.889999999999665 | 1 | 19.78 | 293.436 |
| 9.899999999999665 | 1 | 19.8 | 294.03 |
| 9.909999999999664 | 1 | 19.82 | 294.624 |
| 9.919999999999664 | 1 | 19.84 | 295.219 |
| 9.929999999999662 | 1 | 19.86 | 295.815 |
| 9.939999999999664 | 1 | 19.88 | 296.411 |
| 9.949999999999664 | 1 | 19.9 | 297.007 |
| 9.95999999999966 | 1 | 19.92 | 297.605 |
| 9.96999999999966 | 1 | 19.94 | 298.203 |
| 9.97999999999966 | 1 | 19.96 | 298.801 |
| 9.98999999999966 | 1 | 19.98 | 299.4 |
| 9.99999999999966 | 1 | 20 | 300 |